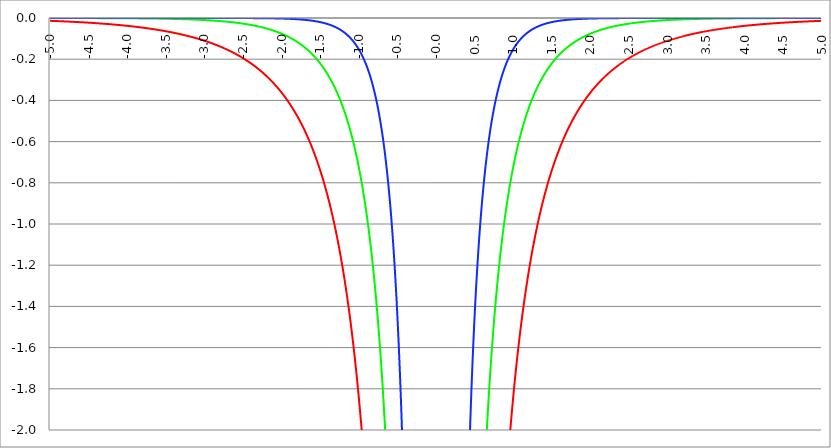
| Category | Series 1 | Series 0 | Series 2 |
|---|---|---|---|
| -5.0 | -0.014 | 0 | 0 |
| -4.995 | -0.014 | 0 | 0 |
| -4.99 | -0.014 | 0 | 0 |
| -4.985 | -0.014 | 0 | 0 |
| -4.98 | -0.014 | 0 | 0 |
| -4.975 | -0.014 | 0 | 0 |
| -4.97 | -0.014 | 0 | 0 |
| -4.965000000000001 | -0.014 | 0 | 0 |
| -4.960000000000001 | -0.014 | 0 | 0 |
| -4.955000000000001 | -0.014 | 0 | 0 |
| -4.950000000000001 | -0.014 | 0 | 0 |
| -4.945000000000001 | -0.014 | 0 | 0 |
| -4.940000000000001 | -0.015 | 0 | 0 |
| -4.935000000000001 | -0.015 | 0 | 0 |
| -4.930000000000001 | -0.015 | 0 | 0 |
| -4.925000000000002 | -0.015 | 0 | 0 |
| -4.920000000000002 | -0.015 | 0 | 0 |
| -4.915000000000002 | -0.015 | 0 | 0 |
| -4.910000000000002 | -0.015 | 0 | 0 |
| -4.905000000000002 | -0.015 | 0 | 0 |
| -4.900000000000002 | -0.015 | 0 | 0 |
| -4.895000000000002 | -0.015 | 0 | 0 |
| -4.890000000000002 | -0.015 | 0 | 0 |
| -4.885000000000002 | -0.015 | 0 | 0 |
| -4.880000000000002 | -0.015 | 0 | 0 |
| -4.875000000000003 | -0.016 | 0 | 0 |
| -4.870000000000003 | -0.016 | 0 | 0 |
| -4.865000000000003 | -0.016 | 0 | 0 |
| -4.860000000000003 | -0.016 | 0 | 0 |
| -4.855000000000003 | -0.016 | 0 | 0 |
| -4.850000000000003 | -0.016 | 0 | 0 |
| -4.845000000000003 | -0.016 | 0 | 0 |
| -4.840000000000003 | -0.016 | 0 | 0 |
| -4.835000000000003 | -0.016 | 0 | 0 |
| -4.830000000000004 | -0.016 | 0 | 0 |
| -4.825000000000004 | -0.016 | 0 | 0 |
| -4.820000000000004 | -0.016 | 0 | 0 |
| -4.815000000000004 | -0.016 | 0 | 0 |
| -4.810000000000004 | -0.017 | 0 | 0 |
| -4.805000000000004 | -0.017 | 0 | 0 |
| -4.800000000000004 | -0.017 | 0 | 0 |
| -4.795000000000004 | -0.017 | 0 | 0 |
| -4.790000000000004 | -0.017 | 0 | 0 |
| -4.785000000000004 | -0.017 | 0 | 0 |
| -4.780000000000004 | -0.017 | 0 | 0 |
| -4.775000000000004 | -0.017 | 0 | 0 |
| -4.770000000000004 | -0.017 | 0 | 0 |
| -4.765000000000005 | -0.017 | 0 | 0 |
| -4.760000000000005 | -0.017 | 0 | 0 |
| -4.755000000000005 | -0.018 | 0 | 0 |
| -4.750000000000005 | -0.018 | 0 | 0 |
| -4.745000000000005 | -0.018 | 0 | 0 |
| -4.740000000000005 | -0.018 | 0 | 0 |
| -4.735000000000005 | -0.018 | 0 | 0 |
| -4.730000000000005 | -0.018 | 0 | 0 |
| -4.725000000000006 | -0.018 | 0 | 0 |
| -4.720000000000006 | -0.018 | 0 | 0 |
| -4.715000000000006 | -0.018 | 0 | 0 |
| -4.710000000000006 | -0.018 | 0 | 0 |
| -4.705000000000006 | -0.018 | 0 | 0 |
| -4.700000000000006 | -0.019 | 0 | 0 |
| -4.695000000000006 | -0.019 | 0 | 0 |
| -4.690000000000006 | -0.019 | 0 | 0 |
| -4.685000000000007 | -0.019 | 0 | 0 |
| -4.680000000000007 | -0.019 | 0 | 0 |
| -4.675000000000007 | -0.019 | 0 | 0 |
| -4.670000000000007 | -0.019 | 0 | 0 |
| -4.665000000000007 | -0.019 | 0 | 0 |
| -4.660000000000007 | -0.019 | 0 | 0 |
| -4.655000000000007 | -0.019 | 0 | 0 |
| -4.650000000000007 | -0.019 | 0 | 0 |
| -4.645000000000007 | -0.02 | 0 | 0 |
| -4.640000000000008 | -0.02 | 0 | 0 |
| -4.635000000000008 | -0.02 | 0 | 0 |
| -4.630000000000008 | -0.02 | 0 | 0 |
| -4.625000000000008 | -0.02 | 0 | 0 |
| -4.620000000000008 | -0.02 | 0 | 0 |
| -4.615000000000008 | -0.02 | 0 | 0 |
| -4.610000000000008 | -0.02 | 0 | 0 |
| -4.605000000000008 | -0.02 | 0 | 0 |
| -4.600000000000008 | -0.021 | 0 | 0 |
| -4.595000000000009 | -0.021 | 0 | 0 |
| -4.590000000000009 | -0.021 | 0 | 0 |
| -4.585000000000009 | -0.021 | 0 | 0 |
| -4.580000000000009 | -0.021 | 0 | 0 |
| -4.57500000000001 | -0.021 | 0 | 0 |
| -4.57000000000001 | -0.021 | 0 | 0 |
| -4.565000000000009 | -0.021 | 0 | 0 |
| -4.560000000000009 | -0.021 | 0 | 0 |
| -4.555000000000009 | -0.021 | 0 | 0 |
| -4.55000000000001 | -0.022 | 0 | 0 |
| -4.54500000000001 | -0.022 | 0 | 0 |
| -4.54000000000001 | -0.022 | 0 | 0 |
| -4.53500000000001 | -0.022 | 0 | 0 |
| -4.53000000000001 | -0.022 | 0 | 0 |
| -4.52500000000001 | -0.022 | 0 | 0 |
| -4.52000000000001 | -0.022 | 0 | 0 |
| -4.51500000000001 | -0.022 | 0 | 0 |
| -4.51000000000001 | -0.022 | 0 | 0 |
| -4.505000000000011 | -0.023 | 0 | 0 |
| -4.500000000000011 | -0.023 | 0 | 0 |
| -4.495000000000011 | -0.023 | 0 | 0 |
| -4.490000000000011 | -0.023 | -0.001 | 0 |
| -4.485000000000011 | -0.023 | -0.001 | 0 |
| -4.480000000000011 | -0.023 | -0.001 | 0 |
| -4.475000000000011 | -0.023 | -0.001 | 0 |
| -4.470000000000011 | -0.023 | -0.001 | 0 |
| -4.465000000000011 | -0.024 | -0.001 | 0 |
| -4.460000000000011 | -0.024 | -0.001 | 0 |
| -4.455000000000012 | -0.024 | -0.001 | 0 |
| -4.450000000000012 | -0.024 | -0.001 | 0 |
| -4.445000000000012 | -0.024 | -0.001 | 0 |
| -4.440000000000012 | -0.024 | -0.001 | 0 |
| -4.435000000000012 | -0.024 | -0.001 | 0 |
| -4.430000000000012 | -0.024 | -0.001 | 0 |
| -4.425000000000012 | -0.025 | -0.001 | 0 |
| -4.420000000000012 | -0.025 | -0.001 | 0 |
| -4.415000000000012 | -0.025 | -0.001 | 0 |
| -4.410000000000013 | -0.025 | -0.001 | 0 |
| -4.405000000000013 | -0.025 | -0.001 | 0 |
| -4.400000000000013 | -0.025 | -0.001 | 0 |
| -4.395000000000013 | -0.025 | -0.001 | 0 |
| -4.390000000000013 | -0.025 | -0.001 | 0 |
| -4.385000000000013 | -0.026 | -0.001 | 0 |
| -4.380000000000013 | -0.026 | -0.001 | 0 |
| -4.375000000000013 | -0.026 | -0.001 | 0 |
| -4.370000000000013 | -0.026 | -0.001 | 0 |
| -4.365000000000013 | -0.026 | -0.001 | 0 |
| -4.360000000000014 | -0.026 | -0.001 | 0 |
| -4.355000000000014 | -0.026 | -0.001 | 0 |
| -4.350000000000014 | -0.026 | -0.001 | 0 |
| -4.345000000000014 | -0.027 | -0.001 | 0 |
| -4.340000000000014 | -0.027 | -0.001 | 0 |
| -4.335000000000014 | -0.027 | -0.001 | 0 |
| -4.330000000000014 | -0.027 | -0.001 | 0 |
| -4.325000000000014 | -0.027 | -0.001 | 0 |
| -4.320000000000014 | -0.027 | -0.001 | 0 |
| -4.315000000000015 | -0.027 | -0.001 | 0 |
| -4.310000000000015 | -0.028 | -0.001 | 0 |
| -4.305000000000015 | -0.028 | -0.001 | 0 |
| -4.300000000000015 | -0.028 | -0.001 | 0 |
| -4.295000000000015 | -0.028 | -0.001 | 0 |
| -4.290000000000015 | -0.028 | -0.001 | 0 |
| -4.285000000000015 | -0.028 | -0.001 | 0 |
| -4.280000000000015 | -0.028 | -0.001 | 0 |
| -4.275000000000015 | -0.029 | -0.001 | 0 |
| -4.270000000000015 | -0.029 | -0.001 | 0 |
| -4.265000000000016 | -0.029 | -0.001 | 0 |
| -4.260000000000016 | -0.029 | -0.001 | 0 |
| -4.255000000000016 | -0.029 | -0.001 | 0 |
| -4.250000000000016 | -0.029 | -0.001 | 0 |
| -4.245000000000016 | -0.03 | -0.001 | 0 |
| -4.240000000000016 | -0.03 | -0.001 | 0 |
| -4.235000000000016 | -0.03 | -0.001 | 0 |
| -4.230000000000016 | -0.03 | -0.001 | 0 |
| -4.225000000000017 | -0.03 | -0.001 | 0 |
| -4.220000000000017 | -0.03 | -0.001 | 0 |
| -4.215000000000017 | -0.03 | -0.001 | 0 |
| -4.210000000000017 | -0.031 | -0.001 | 0 |
| -4.205000000000017 | -0.031 | -0.001 | 0 |
| -4.200000000000017 | -0.031 | -0.001 | 0 |
| -4.195000000000017 | -0.031 | -0.001 | 0 |
| -4.190000000000017 | -0.031 | -0.001 | 0 |
| -4.185000000000017 | -0.031 | -0.001 | 0 |
| -4.180000000000017 | -0.032 | -0.001 | 0 |
| -4.175000000000018 | -0.032 | -0.001 | 0 |
| -4.170000000000018 | -0.032 | -0.001 | 0 |
| -4.165000000000018 | -0.032 | -0.001 | 0 |
| -4.160000000000018 | -0.032 | -0.001 | 0 |
| -4.155000000000018 | -0.032 | -0.001 | 0 |
| -4.150000000000018 | -0.033 | -0.001 | 0 |
| -4.145000000000018 | -0.033 | -0.001 | 0 |
| -4.140000000000018 | -0.033 | -0.001 | 0 |
| -4.135000000000018 | -0.033 | -0.001 | 0 |
| -4.130000000000019 | -0.033 | -0.001 | 0 |
| -4.125000000000019 | -0.033 | -0.001 | 0 |
| -4.120000000000019 | -0.034 | -0.001 | 0 |
| -4.115000000000019 | -0.034 | -0.001 | 0 |
| -4.110000000000019 | -0.034 | -0.001 | 0 |
| -4.105000000000019 | -0.034 | -0.001 | 0 |
| -4.100000000000019 | -0.034 | -0.001 | 0 |
| -4.095000000000019 | -0.034 | -0.001 | 0 |
| -4.090000000000019 | -0.035 | -0.001 | 0 |
| -4.085000000000019 | -0.035 | -0.001 | 0 |
| -4.08000000000002 | -0.035 | -0.001 | 0 |
| -4.07500000000002 | -0.035 | -0.001 | 0 |
| -4.07000000000002 | -0.035 | -0.001 | 0 |
| -4.06500000000002 | -0.036 | -0.001 | 0 |
| -4.06000000000002 | -0.036 | -0.001 | 0 |
| -4.05500000000002 | -0.036 | -0.001 | 0 |
| -4.05000000000002 | -0.036 | -0.001 | 0 |
| -4.04500000000002 | -0.036 | -0.001 | 0 |
| -4.04000000000002 | -0.036 | -0.001 | 0 |
| -4.03500000000002 | -0.037 | -0.001 | 0 |
| -4.03000000000002 | -0.037 | -0.001 | 0 |
| -4.025000000000021 | -0.037 | -0.001 | 0 |
| -4.020000000000021 | -0.037 | -0.001 | 0 |
| -4.015000000000021 | -0.037 | -0.001 | 0 |
| -4.010000000000021 | -0.038 | -0.001 | 0 |
| -4.005000000000021 | -0.038 | -0.001 | 0 |
| -4.000000000000021 | -0.038 | -0.001 | 0 |
| -3.995000000000021 | -0.038 | -0.001 | 0 |
| -3.990000000000021 | -0.038 | -0.001 | 0 |
| -3.985000000000022 | -0.039 | -0.001 | 0 |
| -3.980000000000022 | -0.039 | -0.001 | 0 |
| -3.975000000000022 | -0.039 | -0.001 | 0 |
| -3.970000000000022 | -0.039 | -0.001 | 0 |
| -3.965000000000022 | -0.039 | -0.001 | 0 |
| -3.960000000000022 | -0.04 | -0.001 | 0 |
| -3.955000000000022 | -0.04 | -0.001 | 0 |
| -3.950000000000022 | -0.04 | -0.001 | 0 |
| -3.945000000000022 | -0.04 | -0.001 | 0 |
| -3.940000000000023 | -0.04 | -0.002 | 0 |
| -3.935000000000023 | -0.041 | -0.002 | 0 |
| -3.930000000000023 | -0.041 | -0.002 | 0 |
| -3.925000000000023 | -0.041 | -0.002 | 0 |
| -3.920000000000023 | -0.041 | -0.002 | 0 |
| -3.915000000000023 | -0.042 | -0.002 | 0 |
| -3.910000000000023 | -0.042 | -0.002 | 0 |
| -3.905000000000023 | -0.042 | -0.002 | 0 |
| -3.900000000000023 | -0.042 | -0.002 | 0 |
| -3.895000000000023 | -0.042 | -0.002 | 0 |
| -3.890000000000024 | -0.043 | -0.002 | 0 |
| -3.885000000000024 | -0.043 | -0.002 | 0 |
| -3.880000000000024 | -0.043 | -0.002 | 0 |
| -3.875000000000024 | -0.043 | -0.002 | 0 |
| -3.870000000000024 | -0.044 | -0.002 | 0 |
| -3.865000000000024 | -0.044 | -0.002 | 0 |
| -3.860000000000024 | -0.044 | -0.002 | 0 |
| -3.855000000000024 | -0.044 | -0.002 | 0 |
| -3.850000000000024 | -0.044 | -0.002 | 0 |
| -3.845000000000025 | -0.045 | -0.002 | 0 |
| -3.840000000000025 | -0.045 | -0.002 | 0 |
| -3.835000000000025 | -0.045 | -0.002 | 0 |
| -3.830000000000025 | -0.045 | -0.002 | 0 |
| -3.825000000000025 | -0.046 | -0.002 | 0 |
| -3.820000000000025 | -0.046 | -0.002 | 0 |
| -3.815000000000025 | -0.046 | -0.002 | 0 |
| -3.810000000000025 | -0.046 | -0.002 | 0 |
| -3.805000000000025 | -0.047 | -0.002 | 0 |
| -3.800000000000026 | -0.047 | -0.002 | 0 |
| -3.795000000000026 | -0.047 | -0.002 | 0 |
| -3.790000000000026 | -0.047 | -0.002 | 0 |
| -3.785000000000026 | -0.048 | -0.002 | 0 |
| -3.780000000000026 | -0.048 | -0.002 | 0 |
| -3.775000000000026 | -0.048 | -0.002 | 0 |
| -3.770000000000026 | -0.048 | -0.002 | 0 |
| -3.765000000000026 | -0.049 | -0.002 | 0 |
| -3.760000000000026 | -0.049 | -0.002 | 0 |
| -3.755000000000026 | -0.049 | -0.002 | 0 |
| -3.750000000000027 | -0.049 | -0.002 | 0 |
| -3.745000000000027 | -0.05 | -0.002 | 0 |
| -3.740000000000027 | -0.05 | -0.002 | 0 |
| -3.735000000000027 | -0.05 | -0.002 | 0 |
| -3.730000000000027 | -0.05 | -0.002 | 0 |
| -3.725000000000027 | -0.051 | -0.002 | 0 |
| -3.720000000000027 | -0.051 | -0.002 | 0 |
| -3.715000000000027 | -0.051 | -0.002 | 0 |
| -3.710000000000027 | -0.051 | -0.002 | 0 |
| -3.705000000000028 | -0.052 | -0.002 | 0 |
| -3.700000000000028 | -0.052 | -0.002 | 0 |
| -3.695000000000028 | -0.052 | -0.002 | 0 |
| -3.690000000000028 | -0.053 | -0.002 | 0 |
| -3.685000000000028 | -0.053 | -0.003 | 0 |
| -3.680000000000028 | -0.053 | -0.003 | 0 |
| -3.675000000000028 | -0.053 | -0.003 | 0 |
| -3.670000000000028 | -0.054 | -0.003 | 0 |
| -3.665000000000028 | -0.054 | -0.003 | 0 |
| -3.660000000000028 | -0.054 | -0.003 | 0 |
| -3.655000000000029 | -0.055 | -0.003 | 0 |
| -3.650000000000029 | -0.055 | -0.003 | 0 |
| -3.645000000000029 | -0.055 | -0.003 | 0 |
| -3.640000000000029 | -0.055 | -0.003 | 0 |
| -3.635000000000029 | -0.056 | -0.003 | 0 |
| -3.630000000000029 | -0.056 | -0.003 | 0 |
| -3.625000000000029 | -0.056 | -0.003 | 0 |
| -3.620000000000029 | -0.057 | -0.003 | 0 |
| -3.615000000000029 | -0.057 | -0.003 | 0 |
| -3.61000000000003 | -0.057 | -0.003 | 0 |
| -3.60500000000003 | -0.057 | -0.003 | 0 |
| -3.60000000000003 | -0.058 | -0.003 | 0 |
| -3.59500000000003 | -0.058 | -0.003 | 0 |
| -3.59000000000003 | -0.058 | -0.003 | 0 |
| -3.58500000000003 | -0.059 | -0.003 | 0 |
| -3.58000000000003 | -0.059 | -0.003 | 0 |
| -3.57500000000003 | -0.059 | -0.003 | 0 |
| -3.57000000000003 | -0.06 | -0.003 | 0 |
| -3.565000000000031 | -0.06 | -0.003 | 0 |
| -3.560000000000031 | -0.06 | -0.003 | 0 |
| -3.555000000000031 | -0.061 | -0.003 | 0 |
| -3.550000000000031 | -0.061 | -0.003 | 0 |
| -3.545000000000031 | -0.061 | -0.003 | 0 |
| -3.540000000000031 | -0.062 | -0.003 | 0 |
| -3.535000000000031 | -0.062 | -0.003 | 0 |
| -3.530000000000031 | -0.062 | -0.003 | 0 |
| -3.525000000000031 | -0.063 | -0.003 | 0 |
| -3.520000000000032 | -0.063 | -0.004 | 0 |
| -3.515000000000032 | -0.063 | -0.004 | 0 |
| -3.510000000000032 | -0.064 | -0.004 | 0 |
| -3.505000000000032 | -0.064 | -0.004 | 0 |
| -3.500000000000032 | -0.064 | -0.004 | 0 |
| -3.495000000000032 | -0.065 | -0.004 | 0 |
| -3.490000000000032 | -0.065 | -0.004 | 0 |
| -3.485000000000032 | -0.065 | -0.004 | 0 |
| -3.480000000000032 | -0.066 | -0.004 | 0 |
| -3.475000000000032 | -0.066 | -0.004 | 0 |
| -3.470000000000033 | -0.066 | -0.004 | 0 |
| -3.465000000000033 | -0.067 | -0.004 | 0 |
| -3.460000000000033 | -0.067 | -0.004 | 0 |
| -3.455000000000033 | -0.067 | -0.004 | 0 |
| -3.450000000000033 | -0.068 | -0.004 | 0 |
| -3.445000000000033 | -0.068 | -0.004 | 0 |
| -3.440000000000033 | -0.068 | -0.004 | 0 |
| -3.435000000000033 | -0.069 | -0.004 | 0 |
| -3.430000000000033 | -0.069 | -0.004 | 0 |
| -3.425000000000034 | -0.07 | -0.004 | 0 |
| -3.420000000000034 | -0.07 | -0.004 | 0 |
| -3.415000000000034 | -0.07 | -0.004 | 0 |
| -3.410000000000034 | -0.071 | -0.004 | 0 |
| -3.405000000000034 | -0.071 | -0.004 | 0 |
| -3.400000000000034 | -0.071 | -0.004 | 0 |
| -3.395000000000034 | -0.072 | -0.005 | 0 |
| -3.390000000000034 | -0.072 | -0.005 | 0 |
| -3.385000000000034 | -0.073 | -0.005 | 0 |
| -3.380000000000034 | -0.073 | -0.005 | 0 |
| -3.375000000000035 | -0.073 | -0.005 | 0 |
| -3.370000000000035 | -0.074 | -0.005 | 0 |
| -3.365000000000035 | -0.074 | -0.005 | 0 |
| -3.360000000000035 | -0.075 | -0.005 | 0 |
| -3.355000000000035 | -0.075 | -0.005 | 0 |
| -3.350000000000035 | -0.075 | -0.005 | 0 |
| -3.345000000000035 | -0.076 | -0.005 | 0 |
| -3.340000000000035 | -0.076 | -0.005 | 0 |
| -3.335000000000035 | -0.077 | -0.005 | 0 |
| -3.330000000000036 | -0.077 | -0.005 | 0 |
| -3.325000000000036 | -0.077 | -0.005 | 0 |
| -3.320000000000036 | -0.078 | -0.005 | 0 |
| -3.315000000000036 | -0.078 | -0.005 | 0 |
| -3.310000000000036 | -0.079 | -0.005 | 0 |
| -3.305000000000036 | -0.079 | -0.005 | 0 |
| -3.300000000000036 | -0.08 | -0.005 | 0 |
| -3.295000000000036 | -0.08 | -0.006 | 0 |
| -3.290000000000036 | -0.08 | -0.006 | 0 |
| -3.285000000000036 | -0.081 | -0.006 | 0 |
| -3.280000000000036 | -0.081 | -0.006 | 0 |
| -3.275000000000037 | -0.082 | -0.006 | 0 |
| -3.270000000000037 | -0.082 | -0.006 | 0 |
| -3.265000000000037 | -0.083 | -0.006 | 0 |
| -3.260000000000037 | -0.083 | -0.006 | 0 |
| -3.255000000000037 | -0.083 | -0.006 | 0 |
| -3.250000000000037 | -0.084 | -0.006 | 0 |
| -3.245000000000037 | -0.084 | -0.006 | 0 |
| -3.240000000000037 | -0.085 | -0.006 | 0 |
| -3.235000000000038 | -0.085 | -0.006 | 0 |
| -3.230000000000038 | -0.086 | -0.006 | 0 |
| -3.225000000000038 | -0.086 | -0.006 | 0 |
| -3.220000000000038 | -0.087 | -0.006 | 0 |
| -3.215000000000038 | -0.087 | -0.006 | 0 |
| -3.210000000000038 | -0.088 | -0.007 | 0 |
| -3.205000000000038 | -0.088 | -0.007 | 0 |
| -3.200000000000038 | -0.089 | -0.007 | 0 |
| -3.195000000000038 | -0.089 | -0.007 | 0 |
| -3.190000000000039 | -0.09 | -0.007 | 0 |
| -3.185000000000039 | -0.09 | -0.007 | 0 |
| -3.180000000000039 | -0.091 | -0.007 | 0 |
| -3.175000000000039 | -0.091 | -0.007 | 0 |
| -3.170000000000039 | -0.092 | -0.007 | 0 |
| -3.16500000000004 | -0.092 | -0.007 | 0 |
| -3.16000000000004 | -0.093 | -0.007 | 0 |
| -3.155000000000039 | -0.093 | -0.007 | 0 |
| -3.150000000000039 | -0.094 | -0.007 | 0 |
| -3.14500000000004 | -0.094 | -0.007 | 0 |
| -3.14000000000004 | -0.095 | -0.008 | 0 |
| -3.13500000000004 | -0.095 | -0.008 | 0 |
| -3.13000000000004 | -0.096 | -0.008 | 0 |
| -3.12500000000004 | -0.096 | -0.008 | 0 |
| -3.12000000000004 | -0.097 | -0.008 | 0 |
| -3.11500000000004 | -0.097 | -0.008 | 0 |
| -3.11000000000004 | -0.098 | -0.008 | 0 |
| -3.10500000000004 | -0.098 | -0.008 | 0 |
| -3.10000000000004 | -0.099 | -0.008 | 0 |
| -3.095000000000041 | -0.099 | -0.008 | 0 |
| -3.090000000000041 | -0.1 | -0.008 | 0 |
| -3.085000000000041 | -0.1 | -0.008 | 0 |
| -3.080000000000041 | -0.101 | -0.008 | 0 |
| -3.075000000000041 | -0.102 | -0.009 | 0 |
| -3.070000000000041 | -0.102 | -0.009 | 0 |
| -3.065000000000041 | -0.103 | -0.009 | 0 |
| -3.060000000000041 | -0.103 | -0.009 | 0 |
| -3.055000000000041 | -0.104 | -0.009 | 0 |
| -3.050000000000042 | -0.104 | -0.009 | 0 |
| -3.045000000000042 | -0.105 | -0.009 | 0 |
| -3.040000000000042 | -0.106 | -0.009 | 0 |
| -3.035000000000042 | -0.106 | -0.009 | 0 |
| -3.030000000000042 | -0.107 | -0.009 | 0 |
| -3.025000000000042 | -0.107 | -0.009 | 0 |
| -3.020000000000042 | -0.108 | -0.01 | 0 |
| -3.015000000000042 | -0.108 | -0.01 | 0 |
| -3.010000000000042 | -0.109 | -0.01 | 0 |
| -3.005000000000043 | -0.11 | -0.01 | 0 |
| -3.000000000000043 | -0.11 | -0.01 | 0 |
| -2.995000000000043 | -0.111 | -0.01 | 0 |
| -2.990000000000043 | -0.112 | -0.01 | 0 |
| -2.985000000000043 | -0.112 | -0.01 | 0 |
| -2.980000000000043 | -0.113 | -0.01 | 0 |
| -2.975000000000043 | -0.113 | -0.01 | 0 |
| -2.970000000000043 | -0.114 | -0.011 | 0 |
| -2.965000000000043 | -0.115 | -0.011 | 0 |
| -2.960000000000043 | -0.115 | -0.011 | 0 |
| -2.955000000000044 | -0.116 | -0.011 | 0 |
| -2.950000000000044 | -0.117 | -0.011 | 0 |
| -2.945000000000044 | -0.117 | -0.011 | 0 |
| -2.940000000000044 | -0.118 | -0.011 | 0 |
| -2.935000000000044 | -0.119 | -0.011 | 0 |
| -2.930000000000044 | -0.119 | -0.011 | 0 |
| -2.925000000000044 | -0.12 | -0.012 | 0 |
| -2.920000000000044 | -0.121 | -0.012 | 0 |
| -2.915000000000044 | -0.121 | -0.012 | 0 |
| -2.910000000000045 | -0.122 | -0.012 | 0 |
| -2.905000000000045 | -0.123 | -0.012 | 0 |
| -2.900000000000045 | -0.123 | -0.012 | 0 |
| -2.895000000000045 | -0.124 | -0.012 | 0 |
| -2.890000000000045 | -0.125 | -0.012 | 0 |
| -2.885000000000045 | -0.125 | -0.013 | 0 |
| -2.880000000000045 | -0.126 | -0.013 | 0 |
| -2.875000000000045 | -0.127 | -0.013 | 0 |
| -2.870000000000045 | -0.127 | -0.013 | 0 |
| -2.865000000000045 | -0.128 | -0.013 | 0 |
| -2.860000000000046 | -0.129 | -0.013 | 0 |
| -2.855000000000046 | -0.13 | -0.013 | 0 |
| -2.850000000000046 | -0.13 | -0.013 | 0 |
| -2.845000000000046 | -0.131 | -0.014 | 0 |
| -2.840000000000046 | -0.132 | -0.014 | 0 |
| -2.835000000000046 | -0.133 | -0.014 | 0 |
| -2.830000000000046 | -0.133 | -0.014 | 0 |
| -2.825000000000046 | -0.134 | -0.014 | 0 |
| -2.820000000000046 | -0.135 | -0.014 | 0 |
| -2.815000000000047 | -0.136 | -0.014 | 0 |
| -2.810000000000047 | -0.136 | -0.015 | 0 |
| -2.805000000000047 | -0.137 | -0.015 | 0 |
| -2.800000000000047 | -0.138 | -0.015 | 0 |
| -2.795000000000047 | -0.139 | -0.015 | 0 |
| -2.790000000000047 | -0.139 | -0.015 | 0 |
| -2.785000000000047 | -0.14 | -0.015 | 0 |
| -2.780000000000047 | -0.141 | -0.016 | 0 |
| -2.775000000000047 | -0.142 | -0.016 | 0 |
| -2.770000000000047 | -0.143 | -0.016 | 0 |
| -2.765000000000048 | -0.143 | -0.016 | 0 |
| -2.760000000000048 | -0.144 | -0.016 | 0 |
| -2.755000000000048 | -0.145 | -0.016 | 0 |
| -2.750000000000048 | -0.146 | -0.016 | 0 |
| -2.745000000000048 | -0.147 | -0.017 | 0 |
| -2.740000000000048 | -0.148 | -0.017 | 0 |
| -2.735000000000048 | -0.148 | -0.017 | 0 |
| -2.730000000000048 | -0.149 | -0.017 | 0 |
| -2.725000000000048 | -0.15 | -0.017 | 0 |
| -2.720000000000049 | -0.151 | -0.018 | 0 |
| -2.715000000000049 | -0.152 | -0.018 | 0 |
| -2.710000000000049 | -0.153 | -0.018 | 0 |
| -2.705000000000049 | -0.154 | -0.018 | 0 |
| -2.700000000000049 | -0.154 | -0.018 | 0 |
| -2.695000000000049 | -0.155 | -0.018 | 0 |
| -2.690000000000049 | -0.156 | -0.019 | 0 |
| -2.685000000000049 | -0.157 | -0.019 | 0 |
| -2.680000000000049 | -0.158 | -0.019 | 0 |
| -2.675000000000049 | -0.159 | -0.019 | 0 |
| -2.67000000000005 | -0.16 | -0.019 | 0 |
| -2.66500000000005 | -0.161 | -0.02 | 0 |
| -2.66000000000005 | -0.162 | -0.02 | 0 |
| -2.65500000000005 | -0.163 | -0.02 | 0 |
| -2.65000000000005 | -0.164 | -0.02 | 0 |
| -2.64500000000005 | -0.165 | -0.02 | 0 |
| -2.64000000000005 | -0.166 | -0.021 | 0 |
| -2.63500000000005 | -0.166 | -0.021 | 0 |
| -2.63000000000005 | -0.167 | -0.021 | 0 |
| -2.625000000000051 | -0.168 | -0.021 | 0 |
| -2.620000000000051 | -0.169 | -0.021 | 0 |
| -2.615000000000051 | -0.17 | -0.022 | 0 |
| -2.610000000000051 | -0.171 | -0.022 | 0 |
| -2.605000000000051 | -0.172 | -0.022 | 0 |
| -2.600000000000051 | -0.173 | -0.022 | 0 |
| -2.595000000000051 | -0.174 | -0.023 | 0 |
| -2.590000000000051 | -0.175 | -0.023 | 0 |
| -2.585000000000051 | -0.176 | -0.023 | 0 |
| -2.580000000000052 | -0.177 | -0.023 | 0 |
| -2.575000000000052 | -0.178 | -0.023 | 0 |
| -2.570000000000052 | -0.179 | -0.024 | 0 |
| -2.565000000000052 | -0.181 | -0.024 | 0 |
| -2.560000000000052 | -0.182 | -0.024 | 0 |
| -2.555000000000052 | -0.183 | -0.024 | 0 |
| -2.550000000000052 | -0.184 | -0.025 | 0 |
| -2.545000000000052 | -0.185 | -0.025 | 0 |
| -2.540000000000052 | -0.186 | -0.025 | 0 |
| -2.535000000000053 | -0.187 | -0.025 | 0 |
| -2.530000000000053 | -0.188 | -0.026 | 0 |
| -2.525000000000053 | -0.189 | -0.026 | 0 |
| -2.520000000000053 | -0.19 | -0.026 | 0 |
| -2.515000000000053 | -0.191 | -0.027 | 0 |
| -2.510000000000053 | -0.193 | -0.027 | 0 |
| -2.505000000000053 | -0.194 | -0.027 | 0 |
| -2.500000000000053 | -0.195 | -0.027 | 0 |
| -2.495000000000053 | -0.196 | -0.028 | 0 |
| -2.490000000000053 | -0.197 | -0.028 | 0 |
| -2.485000000000054 | -0.198 | -0.028 | 0 |
| -2.480000000000054 | -0.2 | -0.028 | 0 |
| -2.475000000000054 | -0.201 | -0.029 | 0 |
| -2.470000000000054 | -0.202 | -0.029 | 0 |
| -2.465000000000054 | -0.203 | -0.029 | 0 |
| -2.460000000000054 | -0.204 | -0.03 | 0 |
| -2.455000000000054 | -0.206 | -0.03 | 0 |
| -2.450000000000054 | -0.207 | -0.03 | 0 |
| -2.445000000000054 | -0.208 | -0.031 | 0 |
| -2.440000000000055 | -0.209 | -0.031 | 0 |
| -2.435000000000055 | -0.21 | -0.031 | 0 |
| -2.430000000000055 | -0.212 | -0.031 | 0 |
| -2.425000000000055 | -0.213 | -0.032 | 0 |
| -2.420000000000055 | -0.214 | -0.032 | -0.001 |
| -2.415000000000055 | -0.216 | -0.032 | -0.001 |
| -2.410000000000055 | -0.217 | -0.033 | -0.001 |
| -2.405000000000055 | -0.218 | -0.033 | -0.001 |
| -2.400000000000055 | -0.219 | -0.033 | -0.001 |
| -2.395000000000055 | -0.221 | -0.034 | -0.001 |
| -2.390000000000056 | -0.222 | -0.034 | -0.001 |
| -2.385000000000056 | -0.223 | -0.035 | -0.001 |
| -2.380000000000056 | -0.225 | -0.035 | -0.001 |
| -2.375000000000056 | -0.226 | -0.035 | -0.001 |
| -2.370000000000056 | -0.228 | -0.036 | -0.001 |
| -2.365000000000056 | -0.229 | -0.036 | -0.001 |
| -2.360000000000056 | -0.23 | -0.036 | -0.001 |
| -2.355000000000056 | -0.232 | -0.037 | -0.001 |
| -2.350000000000056 | -0.233 | -0.037 | -0.001 |
| -2.345000000000057 | -0.234 | -0.037 | -0.001 |
| -2.340000000000057 | -0.236 | -0.038 | -0.001 |
| -2.335000000000057 | -0.237 | -0.038 | -0.001 |
| -2.330000000000057 | -0.239 | -0.039 | -0.001 |
| -2.325000000000057 | -0.24 | -0.039 | -0.001 |
| -2.320000000000057 | -0.242 | -0.039 | -0.001 |
| -2.315000000000057 | -0.243 | -0.04 | -0.001 |
| -2.310000000000057 | -0.245 | -0.04 | -0.001 |
| -2.305000000000057 | -0.246 | -0.041 | -0.001 |
| -2.300000000000058 | -0.248 | -0.041 | -0.001 |
| -2.295000000000058 | -0.249 | -0.041 | -0.001 |
| -2.290000000000058 | -0.251 | -0.042 | -0.001 |
| -2.285000000000058 | -0.252 | -0.042 | -0.001 |
| -2.280000000000058 | -0.254 | -0.043 | -0.001 |
| -2.275000000000058 | -0.255 | -0.043 | -0.001 |
| -2.270000000000058 | -0.257 | -0.044 | -0.001 |
| -2.265000000000058 | -0.259 | -0.044 | -0.001 |
| -2.260000000000058 | -0.26 | -0.045 | -0.001 |
| -2.255000000000058 | -0.262 | -0.045 | -0.001 |
| -2.250000000000059 | -0.263 | -0.045 | -0.001 |
| -2.245000000000059 | -0.265 | -0.046 | -0.001 |
| -2.240000000000059 | -0.267 | -0.046 | -0.001 |
| -2.235000000000059 | -0.268 | -0.047 | -0.001 |
| -2.23000000000006 | -0.27 | -0.047 | -0.001 |
| -2.22500000000006 | -0.272 | -0.048 | -0.001 |
| -2.22000000000006 | -0.273 | -0.048 | -0.001 |
| -2.215000000000059 | -0.275 | -0.049 | -0.001 |
| -2.210000000000059 | -0.277 | -0.049 | -0.001 |
| -2.20500000000006 | -0.279 | -0.05 | -0.001 |
| -2.20000000000006 | -0.28 | -0.05 | -0.001 |
| -2.19500000000006 | -0.282 | -0.051 | -0.001 |
| -2.19000000000006 | -0.284 | -0.051 | -0.001 |
| -2.18500000000006 | -0.286 | -0.052 | -0.001 |
| -2.18000000000006 | -0.287 | -0.052 | -0.001 |
| -2.17500000000006 | -0.289 | -0.053 | -0.001 |
| -2.17000000000006 | -0.291 | -0.054 | -0.001 |
| -2.16500000000006 | -0.293 | -0.054 | -0.001 |
| -2.160000000000061 | -0.295 | -0.055 | -0.001 |
| -2.155000000000061 | -0.297 | -0.055 | -0.001 |
| -2.150000000000061 | -0.298 | -0.056 | -0.001 |
| -2.145000000000061 | -0.3 | -0.056 | -0.002 |
| -2.140000000000061 | -0.302 | -0.057 | -0.002 |
| -2.135000000000061 | -0.304 | -0.058 | -0.002 |
| -2.130000000000061 | -0.306 | -0.058 | -0.002 |
| -2.125000000000061 | -0.308 | -0.059 | -0.002 |
| -2.120000000000061 | -0.31 | -0.059 | -0.002 |
| -2.115000000000061 | -0.312 | -0.06 | -0.002 |
| -2.110000000000062 | -0.314 | -0.061 | -0.002 |
| -2.105000000000062 | -0.316 | -0.061 | -0.002 |
| -2.100000000000062 | -0.318 | -0.062 | -0.002 |
| -2.095000000000062 | -0.32 | -0.062 | -0.002 |
| -2.090000000000062 | -0.322 | -0.063 | -0.002 |
| -2.085000000000062 | -0.324 | -0.064 | -0.002 |
| -2.080000000000062 | -0.326 | -0.064 | -0.002 |
| -2.075000000000062 | -0.328 | -0.065 | -0.002 |
| -2.070000000000062 | -0.331 | -0.066 | -0.002 |
| -2.065000000000063 | -0.333 | -0.066 | -0.002 |
| -2.060000000000063 | -0.335 | -0.067 | -0.002 |
| -2.055000000000063 | -0.337 | -0.068 | -0.002 |
| -2.050000000000063 | -0.339 | -0.069 | -0.002 |
| -2.045000000000063 | -0.341 | -0.069 | -0.002 |
| -2.040000000000063 | -0.344 | -0.07 | -0.002 |
| -2.035000000000063 | -0.346 | -0.071 | -0.002 |
| -2.030000000000063 | -0.348 | -0.071 | -0.002 |
| -2.025000000000063 | -0.35 | -0.072 | -0.002 |
| -2.020000000000064 | -0.353 | -0.073 | -0.002 |
| -2.015000000000064 | -0.355 | -0.074 | -0.003 |
| -2.010000000000064 | -0.357 | -0.074 | -0.003 |
| -2.005000000000064 | -0.36 | -0.075 | -0.003 |
| -2.000000000000064 | -0.362 | -0.076 | -0.003 |
| -1.995000000000064 | -0.364 | -0.077 | -0.003 |
| -1.990000000000064 | -0.367 | -0.078 | -0.003 |
| -1.985000000000064 | -0.369 | -0.078 | -0.003 |
| -1.980000000000064 | -0.372 | -0.079 | -0.003 |
| -1.975000000000064 | -0.374 | -0.08 | -0.003 |
| -1.970000000000065 | -0.377 | -0.081 | -0.003 |
| -1.965000000000065 | -0.379 | -0.082 | -0.003 |
| -1.960000000000065 | -0.382 | -0.083 | -0.003 |
| -1.955000000000065 | -0.384 | -0.083 | -0.003 |
| -1.950000000000065 | -0.387 | -0.084 | -0.003 |
| -1.945000000000065 | -0.389 | -0.085 | -0.003 |
| -1.940000000000065 | -0.392 | -0.086 | -0.003 |
| -1.935000000000065 | -0.395 | -0.087 | -0.003 |
| -1.930000000000065 | -0.397 | -0.088 | -0.004 |
| -1.925000000000066 | -0.4 | -0.089 | -0.004 |
| -1.920000000000066 | -0.403 | -0.09 | -0.004 |
| -1.915000000000066 | -0.405 | -0.091 | -0.004 |
| -1.910000000000066 | -0.408 | -0.092 | -0.004 |
| -1.905000000000066 | -0.411 | -0.093 | -0.004 |
| -1.900000000000066 | -0.414 | -0.094 | -0.004 |
| -1.895000000000066 | -0.416 | -0.095 | -0.004 |
| -1.890000000000066 | -0.419 | -0.096 | -0.004 |
| -1.885000000000066 | -0.422 | -0.097 | -0.004 |
| -1.880000000000066 | -0.425 | -0.098 | -0.004 |
| -1.875000000000067 | -0.428 | -0.099 | -0.004 |
| -1.870000000000067 | -0.431 | -0.1 | -0.005 |
| -1.865000000000067 | -0.434 | -0.101 | -0.005 |
| -1.860000000000067 | -0.437 | -0.102 | -0.005 |
| -1.855000000000067 | -0.44 | -0.103 | -0.005 |
| -1.850000000000067 | -0.443 | -0.104 | -0.005 |
| -1.845000000000067 | -0.446 | -0.105 | -0.005 |
| -1.840000000000067 | -0.449 | -0.106 | -0.005 |
| -1.835000000000067 | -0.452 | -0.107 | -0.005 |
| -1.830000000000068 | -0.455 | -0.108 | -0.005 |
| -1.825000000000068 | -0.458 | -0.11 | -0.005 |
| -1.820000000000068 | -0.461 | -0.111 | -0.006 |
| -1.815000000000068 | -0.465 | -0.112 | -0.006 |
| -1.810000000000068 | -0.468 | -0.113 | -0.006 |
| -1.805000000000068 | -0.471 | -0.114 | -0.006 |
| -1.800000000000068 | -0.475 | -0.116 | -0.006 |
| -1.795000000000068 | -0.478 | -0.117 | -0.006 |
| -1.790000000000068 | -0.481 | -0.118 | -0.006 |
| -1.785000000000068 | -0.485 | -0.119 | -0.006 |
| -1.780000000000069 | -0.488 | -0.121 | -0.006 |
| -1.775000000000069 | -0.491 | -0.122 | -0.007 |
| -1.770000000000069 | -0.495 | -0.123 | -0.007 |
| -1.765000000000069 | -0.498 | -0.124 | -0.007 |
| -1.760000000000069 | -0.502 | -0.126 | -0.007 |
| -1.75500000000007 | -0.506 | -0.127 | -0.007 |
| -1.75000000000007 | -0.509 | -0.128 | -0.007 |
| -1.745000000000069 | -0.513 | -0.13 | -0.007 |
| -1.740000000000069 | -0.516 | -0.131 | -0.008 |
| -1.73500000000007 | -0.52 | -0.133 | -0.008 |
| -1.73000000000007 | -0.524 | -0.134 | -0.008 |
| -1.72500000000007 | -0.528 | -0.135 | -0.008 |
| -1.72000000000007 | -0.531 | -0.137 | -0.008 |
| -1.71500000000007 | -0.535 | -0.138 | -0.008 |
| -1.71000000000007 | -0.539 | -0.14 | -0.009 |
| -1.70500000000007 | -0.543 | -0.141 | -0.009 |
| -1.70000000000007 | -0.547 | -0.143 | -0.009 |
| -1.69500000000007 | -0.551 | -0.144 | -0.009 |
| -1.69000000000007 | -0.555 | -0.146 | -0.009 |
| -1.685000000000071 | -0.559 | -0.148 | -0.009 |
| -1.680000000000071 | -0.563 | -0.149 | -0.01 |
| -1.675000000000071 | -0.567 | -0.151 | -0.01 |
| -1.670000000000071 | -0.571 | -0.152 | -0.01 |
| -1.665000000000071 | -0.576 | -0.154 | -0.01 |
| -1.660000000000071 | -0.58 | -0.156 | -0.01 |
| -1.655000000000071 | -0.584 | -0.157 | -0.011 |
| -1.650000000000071 | -0.588 | -0.159 | -0.011 |
| -1.645000000000071 | -0.593 | -0.161 | -0.011 |
| -1.640000000000072 | -0.597 | -0.163 | -0.011 |
| -1.635000000000072 | -0.602 | -0.164 | -0.012 |
| -1.630000000000072 | -0.606 | -0.166 | -0.012 |
| -1.625000000000072 | -0.611 | -0.168 | -0.012 |
| -1.620000000000072 | -0.615 | -0.17 | -0.012 |
| -1.615000000000072 | -0.62 | -0.172 | -0.013 |
| -1.610000000000072 | -0.624 | -0.173 | -0.013 |
| -1.605000000000072 | -0.629 | -0.175 | -0.013 |
| -1.600000000000072 | -0.634 | -0.177 | -0.013 |
| -1.595000000000073 | -0.639 | -0.179 | -0.014 |
| -1.590000000000073 | -0.644 | -0.181 | -0.014 |
| -1.585000000000073 | -0.648 | -0.183 | -0.014 |
| -1.580000000000073 | -0.653 | -0.185 | -0.014 |
| -1.575000000000073 | -0.658 | -0.187 | -0.015 |
| -1.570000000000073 | -0.663 | -0.189 | -0.015 |
| -1.565000000000073 | -0.669 | -0.191 | -0.015 |
| -1.560000000000073 | -0.674 | -0.193 | -0.016 |
| -1.555000000000073 | -0.679 | -0.195 | -0.016 |
| -1.550000000000074 | -0.684 | -0.198 | -0.016 |
| -1.545000000000074 | -0.689 | -0.2 | -0.017 |
| -1.540000000000074 | -0.695 | -0.202 | -0.017 |
| -1.535000000000074 | -0.7 | -0.204 | -0.017 |
| -1.530000000000074 | -0.706 | -0.206 | -0.018 |
| -1.525000000000074 | -0.711 | -0.209 | -0.018 |
| -1.520000000000074 | -0.717 | -0.211 | -0.018 |
| -1.515000000000074 | -0.722 | -0.213 | -0.019 |
| -1.510000000000074 | -0.728 | -0.216 | -0.019 |
| -1.505000000000074 | -0.734 | -0.218 | -0.02 |
| -1.500000000000075 | -0.739 | -0.221 | -0.02 |
| -1.495000000000075 | -0.745 | -0.223 | -0.02 |
| -1.490000000000075 | -0.751 | -0.225 | -0.021 |
| -1.485000000000075 | -0.757 | -0.228 | -0.021 |
| -1.480000000000075 | -0.763 | -0.231 | -0.022 |
| -1.475000000000075 | -0.769 | -0.233 | -0.022 |
| -1.470000000000075 | -0.775 | -0.236 | -0.022 |
| -1.465000000000075 | -0.782 | -0.238 | -0.023 |
| -1.460000000000075 | -0.788 | -0.241 | -0.023 |
| -1.455000000000076 | -0.794 | -0.244 | -0.024 |
| -1.450000000000076 | -0.801 | -0.246 | -0.024 |
| -1.445000000000076 | -0.807 | -0.249 | -0.025 |
| -1.440000000000076 | -0.814 | -0.252 | -0.025 |
| -1.435000000000076 | -0.82 | -0.255 | -0.026 |
| -1.430000000000076 | -0.827 | -0.258 | -0.026 |
| -1.425000000000076 | -0.834 | -0.261 | -0.027 |
| -1.420000000000076 | -0.841 | -0.264 | -0.027 |
| -1.415000000000076 | -0.848 | -0.267 | -0.028 |
| -1.410000000000077 | -0.855 | -0.27 | -0.029 |
| -1.405000000000077 | -0.862 | -0.273 | -0.029 |
| -1.400000000000077 | -0.869 | -0.276 | -0.03 |
| -1.395000000000077 | -0.876 | -0.279 | -0.03 |
| -1.390000000000077 | -0.883 | -0.282 | -0.031 |
| -1.385000000000077 | -0.891 | -0.285 | -0.032 |
| -1.380000000000077 | -0.898 | -0.289 | -0.032 |
| -1.375000000000077 | -0.906 | -0.292 | -0.033 |
| -1.370000000000077 | -0.913 | -0.295 | -0.034 |
| -1.365000000000077 | -0.921 | -0.299 | -0.034 |
| -1.360000000000078 | -0.929 | -0.302 | -0.035 |
| -1.355000000000078 | -0.937 | -0.305 | -0.036 |
| -1.350000000000078 | -0.945 | -0.309 | -0.036 |
| -1.345000000000078 | -0.953 | -0.313 | -0.037 |
| -1.340000000000078 | -0.961 | -0.316 | -0.038 |
| -1.335000000000078 | -0.969 | -0.32 | -0.039 |
| -1.330000000000078 | -0.978 | -0.323 | -0.04 |
| -1.325000000000078 | -0.986 | -0.327 | -0.04 |
| -1.320000000000078 | -0.995 | -0.331 | -0.041 |
| -1.315000000000079 | -1.003 | -0.335 | -0.042 |
| -1.310000000000079 | -1.012 | -0.339 | -0.043 |
| -1.305000000000079 | -1.021 | -0.343 | -0.044 |
| -1.300000000000079 | -1.03 | -0.347 | -0.045 |
| -1.295000000000079 | -1.039 | -0.351 | -0.046 |
| -1.29000000000008 | -1.048 | -0.355 | -0.046 |
| -1.285000000000079 | -1.057 | -0.359 | -0.047 |
| -1.280000000000079 | -1.067 | -0.363 | -0.048 |
| -1.275000000000079 | -1.076 | -0.367 | -0.049 |
| -1.270000000000079 | -1.086 | -0.372 | -0.05 |
| -1.26500000000008 | -1.096 | -0.376 | -0.051 |
| -1.26000000000008 | -1.106 | -0.381 | -0.052 |
| -1.25500000000008 | -1.116 | -0.385 | -0.054 |
| -1.25000000000008 | -1.126 | -0.39 | -0.055 |
| -1.24500000000008 | -1.136 | -0.394 | -0.056 |
| -1.24000000000008 | -1.146 | -0.399 | -0.057 |
| -1.23500000000008 | -1.157 | -0.404 | -0.058 |
| -1.23000000000008 | -1.167 | -0.409 | -0.059 |
| -1.22500000000008 | -1.178 | -0.413 | -0.06 |
| -1.220000000000081 | -1.189 | -0.418 | -0.062 |
| -1.215000000000081 | -1.2 | -0.423 | -0.063 |
| -1.210000000000081 | -1.211 | -0.429 | -0.064 |
| -1.205000000000081 | -1.222 | -0.434 | -0.066 |
| -1.200000000000081 | -1.234 | -0.439 | -0.067 |
| -1.195000000000081 | -1.245 | -0.444 | -0.068 |
| -1.190000000000081 | -1.257 | -0.45 | -0.07 |
| -1.185000000000081 | -1.269 | -0.455 | -0.071 |
| -1.180000000000081 | -1.281 | -0.461 | -0.073 |
| -1.175000000000082 | -1.293 | -0.466 | -0.074 |
| -1.170000000000082 | -1.305 | -0.472 | -0.076 |
| -1.165000000000082 | -1.318 | -0.478 | -0.077 |
| -1.160000000000082 | -1.33 | -0.483 | -0.079 |
| -1.155000000000082 | -1.343 | -0.489 | -0.08 |
| -1.150000000000082 | -1.356 | -0.495 | -0.082 |
| -1.145000000000082 | -1.369 | -0.501 | -0.084 |
| -1.140000000000082 | -1.383 | -0.508 | -0.085 |
| -1.135000000000082 | -1.396 | -0.514 | -0.087 |
| -1.130000000000082 | -1.41 | -0.52 | -0.089 |
| -1.125000000000083 | -1.424 | -0.527 | -0.091 |
| -1.120000000000083 | -1.438 | -0.533 | -0.093 |
| -1.115000000000083 | -1.452 | -0.54 | -0.095 |
| -1.110000000000083 | -1.466 | -0.547 | -0.097 |
| -1.105000000000083 | -1.481 | -0.554 | -0.099 |
| -1.100000000000083 | -1.496 | -0.561 | -0.101 |
| -1.095000000000083 | -1.511 | -0.568 | -0.103 |
| -1.090000000000083 | -1.526 | -0.575 | -0.105 |
| -1.085000000000083 | -1.542 | -0.582 | -0.107 |
| -1.080000000000084 | -1.557 | -0.589 | -0.109 |
| -1.075000000000084 | -1.573 | -0.597 | -0.112 |
| -1.070000000000084 | -1.589 | -0.604 | -0.114 |
| -1.065000000000084 | -1.606 | -0.612 | -0.116 |
| -1.060000000000084 | -1.622 | -0.62 | -0.119 |
| -1.055000000000084 | -1.639 | -0.628 | -0.121 |
| -1.050000000000084 | -1.656 | -0.636 | -0.124 |
| -1.045000000000084 | -1.674 | -0.644 | -0.126 |
| -1.040000000000084 | -1.691 | -0.653 | -0.129 |
| -1.035000000000085 | -1.709 | -0.661 | -0.132 |
| -1.030000000000085 | -1.727 | -0.67 | -0.134 |
| -1.025000000000085 | -1.745 | -0.678 | -0.137 |
| -1.020000000000085 | -1.764 | -0.687 | -0.14 |
| -1.015000000000085 | -1.783 | -0.696 | -0.143 |
| -1.010000000000085 | -1.802 | -0.705 | -0.146 |
| -1.005000000000085 | -1.822 | -0.715 | -0.149 |
| -1.000000000000085 | -1.841 | -0.724 | -0.152 |
| -0.995000000000085 | -1.861 | -0.734 | -0.155 |
| -0.990000000000085 | -1.882 | -0.743 | -0.158 |
| -0.985000000000085 | -1.902 | -0.753 | -0.162 |
| -0.980000000000085 | -1.924 | -0.763 | -0.165 |
| -0.975000000000085 | -1.945 | -0.774 | -0.169 |
| -0.970000000000085 | -1.967 | -0.784 | -0.172 |
| -0.965000000000085 | -1.989 | -0.794 | -0.176 |
| -0.960000000000085 | -2.011 | -0.805 | -0.18 |
| -0.955000000000085 | -2.034 | -0.816 | -0.183 |
| -0.950000000000085 | -2.057 | -0.827 | -0.187 |
| -0.945000000000085 | -2.08 | -0.838 | -0.191 |
| -0.940000000000085 | -2.104 | -0.85 | -0.195 |
| -0.935000000000085 | -2.128 | -0.862 | -0.199 |
| -0.930000000000085 | -2.153 | -0.873 | -0.204 |
| -0.925000000000085 | -2.178 | -0.886 | -0.208 |
| -0.920000000000085 | -2.203 | -0.898 | -0.212 |
| -0.915000000000085 | -2.229 | -0.91 | -0.217 |
| -0.910000000000085 | -2.255 | -0.923 | -0.221 |
| -0.905000000000085 | -2.282 | -0.936 | -0.226 |
| -0.900000000000085 | -2.309 | -0.949 | -0.231 |
| -0.895000000000085 | -2.337 | -0.962 | -0.236 |
| -0.890000000000085 | -2.365 | -0.976 | -0.241 |
| -0.885000000000085 | -2.393 | -0.99 | -0.246 |
| -0.880000000000085 | -2.422 | -1.004 | -0.251 |
| -0.875000000000085 | -2.452 | -1.018 | -0.257 |
| -0.870000000000085 | -2.482 | -1.033 | -0.262 |
| -0.865000000000085 | -2.512 | -1.048 | -0.268 |
| -0.860000000000085 | -2.543 | -1.063 | -0.274 |
| -0.855000000000085 | -2.575 | -1.078 | -0.28 |
| -0.850000000000085 | -2.607 | -1.094 | -0.286 |
| -0.845000000000085 | -2.64 | -1.11 | -0.292 |
| -0.840000000000085 | -2.674 | -1.126 | -0.298 |
| -0.835000000000085 | -2.708 | -1.143 | -0.305 |
| -0.830000000000085 | -2.742 | -1.16 | -0.311 |
| -0.825000000000085 | -2.777 | -1.177 | -0.318 |
| -0.820000000000085 | -2.813 | -1.194 | -0.325 |
| -0.815000000000085 | -2.85 | -1.212 | -0.332 |
| -0.810000000000085 | -2.887 | -1.23 | -0.339 |
| -0.805000000000085 | -2.925 | -1.249 | -0.347 |
| -0.800000000000085 | -2.964 | -1.268 | -0.354 |
| -0.795000000000085 | -3.003 | -1.287 | -0.362 |
| -0.790000000000085 | -3.043 | -1.307 | -0.37 |
| -0.785000000000085 | -3.084 | -1.327 | -0.378 |
| -0.780000000000085 | -3.126 | -1.347 | -0.387 |
| -0.775000000000085 | -3.168 | -1.368 | -0.395 |
| -0.770000000000085 | -3.211 | -1.389 | -0.404 |
| -0.765000000000085 | -3.256 | -1.411 | -0.413 |
| -0.760000000000085 | -3.301 | -1.433 | -0.422 |
| -0.755000000000085 | -3.347 | -1.456 | -0.431 |
| -0.750000000000085 | -3.393 | -1.479 | -0.441 |
| -0.745000000000085 | -3.441 | -1.502 | -0.451 |
| -0.740000000000085 | -3.49 | -1.526 | -0.461 |
| -0.735000000000085 | -3.54 | -1.551 | -0.471 |
| -0.730000000000085 | -3.591 | -1.576 | -0.482 |
| -0.725000000000085 | -3.643 | -1.601 | -0.493 |
| -0.720000000000085 | -3.696 | -1.628 | -0.504 |
| -0.715000000000085 | -3.75 | -1.654 | -0.516 |
| -0.710000000000085 | -3.805 | -1.681 | -0.527 |
| -0.705000000000085 | -3.861 | -1.709 | -0.539 |
| -0.700000000000085 | -3.919 | -1.738 | -0.552 |
| -0.695000000000085 | -3.978 | -1.767 | -0.564 |
| -0.690000000000085 | -4.038 | -1.797 | -0.577 |
| -0.685000000000085 | -4.1 | -1.827 | -0.59 |
| -0.680000000000085 | -4.162 | -1.858 | -0.604 |
| -0.675000000000085 | -4.227 | -1.89 | -0.618 |
| -0.670000000000085 | -4.292 | -1.922 | -0.632 |
| -0.665000000000085 | -4.36 | -1.955 | -0.647 |
| -0.660000000000085 | -4.428 | -1.989 | -0.662 |
| -0.655000000000085 | -4.499 | -2.024 | -0.677 |
| -0.650000000000085 | -4.571 | -2.06 | -0.693 |
| -0.645000000000085 | -4.644 | -2.096 | -0.71 |
| -0.640000000000085 | -4.72 | -2.134 | -0.726 |
| -0.635000000000085 | -4.797 | -2.172 | -0.744 |
| -0.630000000000085 | -4.876 | -2.211 | -0.761 |
| -0.625000000000085 | -4.957 | -2.251 | -0.779 |
| -0.620000000000085 | -5.039 | -2.292 | -0.798 |
| -0.615000000000085 | -5.124 | -2.334 | -0.817 |
| -0.610000000000085 | -5.211 | -2.378 | -0.837 |
| -0.605000000000085 | -5.3 | -2.422 | -0.857 |
| -0.600000000000085 | -5.392 | -2.467 | -0.878 |
| -0.595000000000085 | -5.486 | -2.514 | -0.899 |
| -0.590000000000085 | -5.582 | -2.561 | -0.921 |
| -0.585000000000085 | -5.68 | -2.61 | -0.944 |
| -0.580000000000085 | -5.781 | -2.661 | -0.967 |
| -0.575000000000085 | -5.885 | -2.712 | -0.991 |
| -0.570000000000085 | -5.992 | -2.765 | -1.015 |
| -0.565000000000085 | -6.101 | -2.82 | -1.041 |
| -0.560000000000085 | -6.213 | -2.875 | -1.067 |
| -0.555000000000085 | -6.329 | -2.933 | -1.094 |
| -0.550000000000085 | -6.447 | -2.992 | -1.121 |
| -0.545000000000085 | -6.569 | -3.052 | -1.15 |
| -0.540000000000085 | -6.694 | -3.115 | -1.179 |
| -0.535000000000085 | -6.823 | -3.179 | -1.209 |
| -0.530000000000085 | -6.956 | -3.245 | -1.24 |
| -0.525000000000085 | -7.092 | -3.312 | -1.272 |
| -0.520000000000085 | -7.232 | -3.382 | -1.305 |
| -0.515000000000085 | -7.376 | -3.454 | -1.339 |
| -0.510000000000085 | -7.525 | -3.528 | -1.374 |
| -0.505000000000085 | -7.678 | -3.604 | -1.411 |
| -0.500000000000085 | -7.835 | -3.683 | -1.448 |
| -0.495000000000085 | -7.998 | -3.764 | -1.487 |
| -0.490000000000085 | -8.165 | -3.847 | -1.527 |
| -0.485000000000085 | -8.338 | -3.933 | -1.568 |
| -0.480000000000085 | -8.516 | -4.022 | -1.61 |
| -0.475000000000085 | -8.699 | -4.113 | -1.654 |
| -0.470000000000085 | -8.889 | -4.208 | -1.7 |
| -0.465000000000085 | -9.085 | -4.305 | -1.747 |
| -0.460000000000085 | -9.287 | -4.406 | -1.796 |
| -0.455000000000085 | -9.496 | -4.51 | -1.846 |
| -0.450000000000085 | -9.712 | -4.618 | -1.898 |
| -0.445000000000085 | -9.935 | -4.729 | -1.952 |
| -0.440000000000085 | -10.166 | -4.844 | -2.008 |
| -0.435000000000085 | -10.404 | -4.964 | -2.066 |
| -0.430000000000085 | -10.652 | -5.087 | -2.126 |
| -0.425000000000085 | -10.907 | -5.215 | -2.188 |
| -0.420000000000085 | -11.173 | -5.347 | -2.252 |
| -0.415000000000085 | -11.447 | -5.484 | -2.319 |
| -0.410000000000085 | -11.732 | -5.626 | -2.389 |
| -0.405000000000085 | -12.028 | -5.774 | -2.461 |
| -0.400000000000085 | -12.335 | -5.927 | -2.536 |
| -0.395000000000085 | -12.653 | -6.086 | -2.614 |
| -0.390000000000085 | -12.984 | -6.251 | -2.695 |
| -0.385000000000085 | -13.328 | -6.423 | -2.779 |
| -0.380000000000085 | -13.685 | -6.601 | -2.866 |
| -0.375000000000085 | -14.057 | -6.787 | -2.958 |
| -0.370000000000085 | -14.444 | -6.98 | -3.053 |
| -0.365000000000085 | -14.847 | -7.181 | -3.152 |
| -0.360000000000085 | -15.267 | -7.391 | -3.255 |
| -0.355000000000085 | -15.704 | -7.61 | -3.363 |
| -0.350000000000085 | -16.161 | -7.838 | -3.476 |
| -0.345000000000085 | -16.638 | -8.076 | -3.593 |
| -0.340000000000085 | -17.135 | -8.325 | -3.716 |
| -0.335000000000085 | -17.656 | -8.585 | -3.845 |
| -0.330000000000085 | -18.2 | -8.857 | -3.979 |
| -0.325000000000085 | -18.769 | -9.141 | -4.12 |
| -0.320000000000085 | -19.365 | -9.439 | -4.267 |
| -0.315000000000085 | -19.99 | -9.751 | -4.422 |
| -0.310000000000085 | -20.646 | -10.079 | -4.585 |
| -0.305000000000085 | -21.334 | -10.423 | -4.755 |
| -0.300000000000085 | -22.056 | -10.784 | -4.934 |
| -0.295000000000085 | -22.816 | -11.163 | -5.123 |
| -0.290000000000085 | -23.615 | -11.563 | -5.321 |
| -0.285000000000085 | -24.457 | -11.983 | -5.53 |
| -0.280000000000085 | -25.344 | -12.427 | -5.751 |
| -0.275000000000085 | -26.28 | -12.895 | -5.983 |
| -0.270000000000085 | -27.269 | -13.389 | -6.229 |
| -0.265000000000085 | -28.314 | -13.911 | -6.489 |
| -0.260000000000085 | -29.42 | -14.464 | -6.764 |
| -0.255000000000085 | -30.591 | -15.05 | -7.056 |
| -0.250000000000085 | -31.834 | -15.671 | -7.365 |
| -0.245000000000085 | -33.153 | -16.33 | -7.694 |
| -0.240000000000085 | -34.556 | -17.032 | -8.044 |
| -0.235000000000085 | -36.049 | -17.778 | -8.416 |
| -0.230000000000085 | -37.641 | -18.574 | -8.812 |
| -0.225000000000085 | -39.34 | -19.423 | -9.236 |
| -0.220000000000085 | -41.156 | -20.331 | -9.689 |
| -0.215000000000085 | -43.1 | -21.303 | -10.174 |
| -0.210000000000085 | -45.185 | -22.345 | -10.694 |
| -0.205000000000085 | -47.424 | -23.465 | -11.253 |
| -0.200000000000085 | -49.834 | -24.669 | -11.854 |
| -0.195000000000085 | -52.431 | -25.968 | -12.502 |
| -0.190000000000085 | -55.235 | -27.37 | -13.203 |
| -0.185000000000085 | -58.27 | -28.887 | -13.96 |
| -0.180000000000085 | -61.562 | -30.533 | -14.782 |
| -0.175000000000085 | -65.14 | -32.322 | -15.676 |
| -0.170000000000085 | -69.038 | -34.271 | -16.65 |
| -0.165000000000085 | -73.295 | -36.399 | -17.713 |
| -0.160000000000085 | -77.959 | -38.731 | -18.878 |
| -0.155000000000084 | -83.08 | -41.292 | -20.158 |
| -0.150000000000084 | -88.722 | -44.113 | -21.567 |
| -0.145000000000084 | -94.958 | -47.23 | -23.126 |
| -0.140000000000084 | -101.874 | -50.688 | -24.854 |
| -0.135000000000084 | -109.573 | -54.538 | -26.778 |
| -0.130000000000084 | -118.177 | -58.839 | -28.928 |
| -0.125000000000084 | -127.833 | -63.668 | -31.342 |
| -0.120000000000084 | -138.722 | -69.112 | -34.063 |
| -0.115000000000084 | -151.062 | -75.282 | -37.148 |
| -0.110000000000084 | -165.123 | -82.312 | -40.662 |
| -0.105000000000084 | -181.239 | -90.37 | -44.691 |
| -0.100000000000084 | -199.833 | -99.667 | -49.339 |
| -0.0950000000000844 | -221.44 | -110.471 | -54.74 |
| -0.0900000000000844 | -246.747 | -123.124 | -61.066 |
| -0.0850000000000844 | -276.65 | -138.075 | -68.541 |
| -0.0800000000000844 | -312.333 | -155.917 | -77.462 |
| -0.0750000000000844 | -355.389 | -177.445 | -88.225 |
| -0.0700000000000844 | -407.997 | -203.749 | -101.377 |
| -0.0650000000000844 | -473.206 | -236.353 | -117.679 |
| -0.0600000000000844 | -555.389 | -277.445 | -138.224 |
| -0.0550000000000844 | -660.99 | -330.245 | -164.624 |
| -0.0500000000000844 | -799.833 | -399.667 | -199.335 |
| -0.0450000000000844 | -987.488 | -493.494 | -246.248 |
| -0.0400000000000844 | -1249.833 | -624.667 | -311.834 |
| -0.0350000000000844 | -1632.486 | -815.993 | -407.497 |
| -0.0300000000000844 | -2222.056 | -1110.778 | -554.889 |
| -0.0250000000000844 | -3199.833 | -1599.667 | -799.334 |
| -0.0200000000000844 | -4999.833 | -2499.667 | -1249.334 |
| -0.0150000000000844 | -8888.722 | -4444.111 | -2221.556 |
| -0.0100000000000844 | -19999.833 | -9999.667 | -4999.333 |
| -0.00500000000008444 | -79999.833 | -39999.667 | -19999.333 |
| -8.4444604087075e-14 | -280919800604594001942675456 | -140275266868023000341413888 | -70091543319643096034050048 |
| 0.00499999999991555 | -79999.833 | -39999.667 | -19999.333 |
| 0.00999999999991555 | -19999.833 | -9999.667 | -4999.333 |
| 0.0149999999999156 | -8888.722 | -4444.111 | -2221.556 |
| 0.0199999999999156 | -4999.833 | -2499.667 | -1249.334 |
| 0.0249999999999156 | -3199.833 | -1599.667 | -799.334 |
| 0.0299999999999156 | -2222.056 | -1110.778 | -554.889 |
| 0.0349999999999155 | -1632.486 | -815.993 | -407.497 |
| 0.0399999999999155 | -1249.833 | -624.667 | -311.834 |
| 0.0449999999999155 | -987.488 | -493.494 | -246.248 |
| 0.0499999999999155 | -799.833 | -399.667 | -199.335 |
| 0.0549999999999155 | -660.99 | -330.245 | -164.624 |
| 0.0599999999999155 | -555.389 | -277.445 | -138.224 |
| 0.0649999999999155 | -473.206 | -236.353 | -117.679 |
| 0.0699999999999155 | -407.997 | -203.749 | -101.377 |
| 0.0749999999999155 | -355.389 | -177.445 | -88.225 |
| 0.0799999999999155 | -312.333 | -155.917 | -77.462 |
| 0.0849999999999155 | -276.65 | -138.075 | -68.541 |
| 0.0899999999999155 | -246.747 | -123.124 | -61.066 |
| 0.0949999999999155 | -221.44 | -110.471 | -54.74 |
| 0.0999999999999155 | -199.833 | -99.667 | -49.339 |
| 0.104999999999916 | -181.239 | -90.37 | -44.691 |
| 0.109999999999916 | -165.123 | -82.312 | -40.662 |
| 0.114999999999916 | -151.062 | -75.282 | -37.148 |
| 0.119999999999916 | -138.722 | -69.112 | -34.063 |
| 0.124999999999916 | -127.833 | -63.668 | -31.342 |
| 0.129999999999916 | -118.177 | -58.839 | -28.928 |
| 0.134999999999916 | -109.573 | -54.538 | -26.778 |
| 0.139999999999916 | -101.874 | -50.688 | -24.854 |
| 0.144999999999916 | -94.958 | -47.23 | -23.126 |
| 0.149999999999916 | -88.722 | -44.113 | -21.567 |
| 0.154999999999916 | -83.08 | -41.292 | -20.158 |
| 0.159999999999916 | -77.959 | -38.731 | -18.878 |
| 0.164999999999916 | -73.295 | -36.399 | -17.713 |
| 0.169999999999916 | -69.038 | -34.271 | -16.65 |
| 0.174999999999916 | -65.14 | -32.322 | -15.676 |
| 0.179999999999916 | -61.562 | -30.533 | -14.782 |
| 0.184999999999916 | -58.27 | -28.887 | -13.96 |
| 0.189999999999916 | -55.235 | -27.37 | -13.203 |
| 0.194999999999916 | -52.431 | -25.968 | -12.502 |
| 0.199999999999916 | -49.834 | -24.669 | -11.854 |
| 0.204999999999916 | -47.424 | -23.465 | -11.253 |
| 0.209999999999916 | -45.185 | -22.345 | -10.694 |
| 0.214999999999916 | -43.1 | -21.303 | -10.174 |
| 0.219999999999916 | -41.156 | -20.331 | -9.689 |
| 0.224999999999916 | -39.34 | -19.423 | -9.236 |
| 0.229999999999916 | -37.641 | -18.574 | -8.812 |
| 0.234999999999916 | -36.049 | -17.778 | -8.416 |
| 0.239999999999916 | -34.556 | -17.032 | -8.044 |
| 0.244999999999916 | -33.153 | -16.33 | -7.694 |
| 0.249999999999916 | -31.834 | -15.671 | -7.365 |
| 0.254999999999916 | -30.591 | -15.05 | -7.056 |
| 0.259999999999916 | -29.42 | -14.464 | -6.764 |
| 0.264999999999916 | -28.314 | -13.911 | -6.489 |
| 0.269999999999916 | -27.269 | -13.389 | -6.229 |
| 0.274999999999916 | -26.28 | -12.895 | -5.983 |
| 0.279999999999916 | -25.344 | -12.427 | -5.751 |
| 0.284999999999916 | -24.457 | -11.983 | -5.53 |
| 0.289999999999916 | -23.615 | -11.563 | -5.321 |
| 0.294999999999916 | -22.816 | -11.163 | -5.123 |
| 0.299999999999916 | -22.056 | -10.784 | -4.934 |
| 0.304999999999916 | -21.334 | -10.423 | -4.755 |
| 0.309999999999916 | -20.646 | -10.079 | -4.585 |
| 0.314999999999916 | -19.99 | -9.751 | -4.422 |
| 0.319999999999916 | -19.365 | -9.439 | -4.267 |
| 0.324999999999916 | -18.769 | -9.141 | -4.12 |
| 0.329999999999916 | -18.2 | -8.857 | -3.979 |
| 0.334999999999916 | -17.656 | -8.585 | -3.845 |
| 0.339999999999916 | -17.135 | -8.325 | -3.716 |
| 0.344999999999916 | -16.638 | -8.076 | -3.593 |
| 0.349999999999916 | -16.161 | -7.838 | -3.476 |
| 0.354999999999916 | -15.704 | -7.61 | -3.363 |
| 0.359999999999916 | -15.267 | -7.391 | -3.255 |
| 0.364999999999916 | -14.847 | -7.181 | -3.152 |
| 0.369999999999916 | -14.444 | -6.98 | -3.053 |
| 0.374999999999916 | -14.057 | -6.787 | -2.958 |
| 0.379999999999916 | -13.685 | -6.601 | -2.866 |
| 0.384999999999916 | -13.328 | -6.423 | -2.779 |
| 0.389999999999916 | -12.984 | -6.251 | -2.695 |
| 0.394999999999916 | -12.653 | -6.086 | -2.614 |
| 0.399999999999916 | -12.335 | -5.927 | -2.536 |
| 0.404999999999916 | -12.028 | -5.774 | -2.461 |
| 0.409999999999916 | -11.732 | -5.626 | -2.389 |
| 0.414999999999916 | -11.447 | -5.484 | -2.319 |
| 0.419999999999916 | -11.173 | -5.347 | -2.252 |
| 0.424999999999916 | -10.907 | -5.215 | -2.188 |
| 0.429999999999916 | -10.652 | -5.087 | -2.126 |
| 0.434999999999916 | -10.404 | -4.964 | -2.066 |
| 0.439999999999916 | -10.166 | -4.844 | -2.008 |
| 0.444999999999916 | -9.935 | -4.729 | -1.952 |
| 0.449999999999916 | -9.712 | -4.618 | -1.898 |
| 0.454999999999916 | -9.496 | -4.51 | -1.846 |
| 0.459999999999916 | -9.287 | -4.406 | -1.796 |
| 0.464999999999916 | -9.085 | -4.305 | -1.747 |
| 0.469999999999916 | -8.889 | -4.208 | -1.7 |
| 0.474999999999916 | -8.699 | -4.113 | -1.654 |
| 0.479999999999916 | -8.516 | -4.022 | -1.61 |
| 0.484999999999916 | -8.338 | -3.933 | -1.568 |
| 0.489999999999916 | -8.165 | -3.847 | -1.527 |
| 0.494999999999916 | -7.998 | -3.764 | -1.487 |
| 0.499999999999916 | -7.835 | -3.683 | -1.448 |
| 0.504999999999916 | -7.678 | -3.604 | -1.411 |
| 0.509999999999916 | -7.525 | -3.528 | -1.374 |
| 0.514999999999916 | -7.376 | -3.454 | -1.339 |
| 0.519999999999916 | -7.232 | -3.382 | -1.305 |
| 0.524999999999916 | -7.092 | -3.312 | -1.272 |
| 0.529999999999916 | -6.956 | -3.245 | -1.24 |
| 0.534999999999916 | -6.823 | -3.179 | -1.209 |
| 0.539999999999916 | -6.694 | -3.115 | -1.179 |
| 0.544999999999916 | -6.569 | -3.052 | -1.15 |
| 0.549999999999916 | -6.447 | -2.992 | -1.121 |
| 0.554999999999916 | -6.329 | -2.933 | -1.094 |
| 0.559999999999916 | -6.213 | -2.875 | -1.067 |
| 0.564999999999916 | -6.101 | -2.82 | -1.041 |
| 0.569999999999916 | -5.992 | -2.765 | -1.015 |
| 0.574999999999916 | -5.885 | -2.712 | -0.991 |
| 0.579999999999916 | -5.781 | -2.661 | -0.967 |
| 0.584999999999916 | -5.68 | -2.61 | -0.944 |
| 0.589999999999916 | -5.582 | -2.561 | -0.921 |
| 0.594999999999916 | -5.486 | -2.514 | -0.899 |
| 0.599999999999916 | -5.392 | -2.467 | -0.878 |
| 0.604999999999916 | -5.3 | -2.422 | -0.857 |
| 0.609999999999916 | -5.211 | -2.378 | -0.837 |
| 0.614999999999916 | -5.124 | -2.334 | -0.817 |
| 0.619999999999916 | -5.039 | -2.292 | -0.798 |
| 0.624999999999916 | -4.957 | -2.251 | -0.779 |
| 0.629999999999916 | -4.876 | -2.211 | -0.761 |
| 0.634999999999916 | -4.797 | -2.172 | -0.744 |
| 0.639999999999916 | -4.72 | -2.134 | -0.726 |
| 0.644999999999916 | -4.644 | -2.096 | -0.71 |
| 0.649999999999916 | -4.571 | -2.06 | -0.693 |
| 0.654999999999916 | -4.499 | -2.024 | -0.677 |
| 0.659999999999916 | -4.428 | -1.989 | -0.662 |
| 0.664999999999916 | -4.36 | -1.955 | -0.647 |
| 0.669999999999916 | -4.292 | -1.922 | -0.632 |
| 0.674999999999916 | -4.227 | -1.89 | -0.618 |
| 0.679999999999916 | -4.162 | -1.858 | -0.604 |
| 0.684999999999916 | -4.1 | -1.827 | -0.59 |
| 0.689999999999916 | -4.038 | -1.797 | -0.577 |
| 0.694999999999916 | -3.978 | -1.767 | -0.564 |
| 0.699999999999916 | -3.919 | -1.738 | -0.552 |
| 0.704999999999916 | -3.861 | -1.709 | -0.539 |
| 0.709999999999916 | -3.805 | -1.681 | -0.527 |
| 0.714999999999916 | -3.75 | -1.654 | -0.516 |
| 0.719999999999916 | -3.696 | -1.628 | -0.504 |
| 0.724999999999916 | -3.643 | -1.601 | -0.493 |
| 0.729999999999916 | -3.591 | -1.576 | -0.482 |
| 0.734999999999916 | -3.54 | -1.551 | -0.471 |
| 0.739999999999916 | -3.49 | -1.526 | -0.461 |
| 0.744999999999916 | -3.441 | -1.502 | -0.451 |
| 0.749999999999916 | -3.393 | -1.479 | -0.441 |
| 0.754999999999916 | -3.347 | -1.456 | -0.431 |
| 0.759999999999916 | -3.301 | -1.433 | -0.422 |
| 0.764999999999916 | -3.256 | -1.411 | -0.413 |
| 0.769999999999916 | -3.211 | -1.389 | -0.404 |
| 0.774999999999916 | -3.168 | -1.368 | -0.395 |
| 0.779999999999916 | -3.126 | -1.347 | -0.387 |
| 0.784999999999916 | -3.084 | -1.327 | -0.378 |
| 0.789999999999916 | -3.043 | -1.307 | -0.37 |
| 0.794999999999916 | -3.003 | -1.287 | -0.362 |
| 0.799999999999916 | -2.964 | -1.268 | -0.354 |
| 0.804999999999916 | -2.925 | -1.249 | -0.347 |
| 0.809999999999916 | -2.887 | -1.23 | -0.339 |
| 0.814999999999916 | -2.85 | -1.212 | -0.332 |
| 0.819999999999916 | -2.813 | -1.194 | -0.325 |
| 0.824999999999916 | -2.777 | -1.177 | -0.318 |
| 0.829999999999916 | -2.742 | -1.16 | -0.311 |
| 0.834999999999916 | -2.708 | -1.143 | -0.305 |
| 0.839999999999916 | -2.674 | -1.126 | -0.298 |
| 0.844999999999916 | -2.64 | -1.11 | -0.292 |
| 0.849999999999916 | -2.607 | -1.094 | -0.286 |
| 0.854999999999916 | -2.575 | -1.078 | -0.28 |
| 0.859999999999916 | -2.543 | -1.063 | -0.274 |
| 0.864999999999916 | -2.512 | -1.048 | -0.268 |
| 0.869999999999916 | -2.482 | -1.033 | -0.262 |
| 0.874999999999916 | -2.452 | -1.018 | -0.257 |
| 0.879999999999916 | -2.422 | -1.004 | -0.251 |
| 0.884999999999916 | -2.393 | -0.99 | -0.246 |
| 0.889999999999916 | -2.365 | -0.976 | -0.241 |
| 0.894999999999916 | -2.337 | -0.962 | -0.236 |
| 0.899999999999916 | -2.309 | -0.949 | -0.231 |
| 0.904999999999916 | -2.282 | -0.936 | -0.226 |
| 0.909999999999916 | -2.255 | -0.923 | -0.221 |
| 0.914999999999916 | -2.229 | -0.91 | -0.217 |
| 0.919999999999916 | -2.203 | -0.898 | -0.212 |
| 0.924999999999916 | -2.178 | -0.886 | -0.208 |
| 0.929999999999916 | -2.153 | -0.873 | -0.204 |
| 0.934999999999916 | -2.128 | -0.862 | -0.199 |
| 0.939999999999916 | -2.104 | -0.85 | -0.195 |
| 0.944999999999916 | -2.08 | -0.838 | -0.191 |
| 0.949999999999916 | -2.057 | -0.827 | -0.187 |
| 0.954999999999916 | -2.034 | -0.816 | -0.183 |
| 0.959999999999916 | -2.011 | -0.805 | -0.18 |
| 0.964999999999916 | -1.989 | -0.794 | -0.176 |
| 0.969999999999916 | -1.967 | -0.784 | -0.172 |
| 0.974999999999916 | -1.945 | -0.774 | -0.169 |
| 0.979999999999916 | -1.924 | -0.763 | -0.165 |
| 0.984999999999916 | -1.902 | -0.753 | -0.162 |
| 0.989999999999916 | -1.882 | -0.743 | -0.158 |
| 0.994999999999916 | -1.861 | -0.734 | -0.155 |
| 0.999999999999916 | -1.841 | -0.724 | -0.152 |
| 1.004999999999916 | -1.822 | -0.715 | -0.149 |
| 1.009999999999916 | -1.802 | -0.705 | -0.146 |
| 1.014999999999916 | -1.783 | -0.696 | -0.143 |
| 1.019999999999916 | -1.764 | -0.687 | -0.14 |
| 1.024999999999916 | -1.745 | -0.678 | -0.137 |
| 1.029999999999916 | -1.727 | -0.67 | -0.134 |
| 1.034999999999916 | -1.709 | -0.661 | -0.132 |
| 1.039999999999915 | -1.691 | -0.653 | -0.129 |
| 1.044999999999915 | -1.674 | -0.644 | -0.126 |
| 1.049999999999915 | -1.656 | -0.636 | -0.124 |
| 1.054999999999915 | -1.639 | -0.628 | -0.121 |
| 1.059999999999915 | -1.622 | -0.62 | -0.119 |
| 1.064999999999915 | -1.606 | -0.612 | -0.116 |
| 1.069999999999915 | -1.589 | -0.604 | -0.114 |
| 1.074999999999915 | -1.573 | -0.597 | -0.112 |
| 1.079999999999915 | -1.557 | -0.589 | -0.109 |
| 1.084999999999914 | -1.542 | -0.582 | -0.107 |
| 1.089999999999914 | -1.526 | -0.575 | -0.105 |
| 1.094999999999914 | -1.511 | -0.568 | -0.103 |
| 1.099999999999914 | -1.496 | -0.561 | -0.101 |
| 1.104999999999914 | -1.481 | -0.554 | -0.099 |
| 1.109999999999914 | -1.466 | -0.547 | -0.097 |
| 1.114999999999914 | -1.452 | -0.54 | -0.095 |
| 1.119999999999914 | -1.438 | -0.533 | -0.093 |
| 1.124999999999914 | -1.424 | -0.527 | -0.091 |
| 1.129999999999914 | -1.41 | -0.52 | -0.089 |
| 1.134999999999913 | -1.396 | -0.514 | -0.087 |
| 1.139999999999913 | -1.383 | -0.508 | -0.085 |
| 1.144999999999913 | -1.369 | -0.501 | -0.084 |
| 1.149999999999913 | -1.356 | -0.495 | -0.082 |
| 1.154999999999913 | -1.343 | -0.489 | -0.08 |
| 1.159999999999913 | -1.33 | -0.483 | -0.079 |
| 1.164999999999913 | -1.318 | -0.478 | -0.077 |
| 1.169999999999913 | -1.305 | -0.472 | -0.076 |
| 1.174999999999913 | -1.293 | -0.466 | -0.074 |
| 1.179999999999912 | -1.281 | -0.461 | -0.073 |
| 1.184999999999912 | -1.269 | -0.455 | -0.071 |
| 1.189999999999912 | -1.257 | -0.45 | -0.07 |
| 1.194999999999912 | -1.245 | -0.444 | -0.068 |
| 1.199999999999912 | -1.234 | -0.439 | -0.067 |
| 1.204999999999912 | -1.222 | -0.434 | -0.066 |
| 1.209999999999912 | -1.211 | -0.429 | -0.064 |
| 1.214999999999912 | -1.2 | -0.423 | -0.063 |
| 1.219999999999912 | -1.189 | -0.418 | -0.062 |
| 1.224999999999911 | -1.178 | -0.413 | -0.06 |
| 1.229999999999911 | -1.167 | -0.409 | -0.059 |
| 1.234999999999911 | -1.157 | -0.404 | -0.058 |
| 1.239999999999911 | -1.146 | -0.399 | -0.057 |
| 1.244999999999911 | -1.136 | -0.394 | -0.056 |
| 1.249999999999911 | -1.126 | -0.39 | -0.055 |
| 1.254999999999911 | -1.116 | -0.385 | -0.054 |
| 1.259999999999911 | -1.106 | -0.381 | -0.052 |
| 1.264999999999911 | -1.096 | -0.376 | -0.051 |
| 1.269999999999911 | -1.086 | -0.372 | -0.05 |
| 1.27499999999991 | -1.076 | -0.367 | -0.049 |
| 1.27999999999991 | -1.067 | -0.363 | -0.048 |
| 1.28499999999991 | -1.057 | -0.359 | -0.047 |
| 1.28999999999991 | -1.048 | -0.355 | -0.046 |
| 1.29499999999991 | -1.039 | -0.351 | -0.046 |
| 1.29999999999991 | -1.03 | -0.347 | -0.045 |
| 1.30499999999991 | -1.021 | -0.343 | -0.044 |
| 1.30999999999991 | -1.012 | -0.339 | -0.043 |
| 1.31499999999991 | -1.003 | -0.335 | -0.042 |
| 1.319999999999909 | -0.995 | -0.331 | -0.041 |
| 1.324999999999909 | -0.986 | -0.327 | -0.04 |
| 1.329999999999909 | -0.978 | -0.323 | -0.04 |
| 1.334999999999909 | -0.969 | -0.32 | -0.039 |
| 1.339999999999909 | -0.961 | -0.316 | -0.038 |
| 1.344999999999909 | -0.953 | -0.313 | -0.037 |
| 1.349999999999909 | -0.945 | -0.309 | -0.036 |
| 1.354999999999909 | -0.937 | -0.305 | -0.036 |
| 1.359999999999909 | -0.929 | -0.302 | -0.035 |
| 1.364999999999908 | -0.921 | -0.299 | -0.034 |
| 1.369999999999908 | -0.913 | -0.295 | -0.034 |
| 1.374999999999908 | -0.906 | -0.292 | -0.033 |
| 1.379999999999908 | -0.898 | -0.289 | -0.032 |
| 1.384999999999908 | -0.891 | -0.285 | -0.032 |
| 1.389999999999908 | -0.883 | -0.282 | -0.031 |
| 1.394999999999908 | -0.876 | -0.279 | -0.03 |
| 1.399999999999908 | -0.869 | -0.276 | -0.03 |
| 1.404999999999908 | -0.862 | -0.273 | -0.029 |
| 1.409999999999908 | -0.855 | -0.27 | -0.029 |
| 1.414999999999907 | -0.848 | -0.267 | -0.028 |
| 1.419999999999907 | -0.841 | -0.264 | -0.027 |
| 1.424999999999907 | -0.834 | -0.261 | -0.027 |
| 1.429999999999907 | -0.827 | -0.258 | -0.026 |
| 1.434999999999907 | -0.82 | -0.255 | -0.026 |
| 1.439999999999907 | -0.814 | -0.252 | -0.025 |
| 1.444999999999907 | -0.807 | -0.249 | -0.025 |
| 1.449999999999907 | -0.801 | -0.246 | -0.024 |
| 1.454999999999907 | -0.794 | -0.244 | -0.024 |
| 1.459999999999906 | -0.788 | -0.241 | -0.023 |
| 1.464999999999906 | -0.782 | -0.238 | -0.023 |
| 1.469999999999906 | -0.775 | -0.236 | -0.022 |
| 1.474999999999906 | -0.769 | -0.233 | -0.022 |
| 1.479999999999906 | -0.763 | -0.231 | -0.022 |
| 1.484999999999906 | -0.757 | -0.228 | -0.021 |
| 1.489999999999906 | -0.751 | -0.225 | -0.021 |
| 1.494999999999906 | -0.745 | -0.223 | -0.02 |
| 1.499999999999906 | -0.739 | -0.221 | -0.02 |
| 1.504999999999906 | -0.734 | -0.218 | -0.02 |
| 1.509999999999905 | -0.728 | -0.216 | -0.019 |
| 1.514999999999905 | -0.722 | -0.213 | -0.019 |
| 1.519999999999905 | -0.717 | -0.211 | -0.018 |
| 1.524999999999905 | -0.711 | -0.209 | -0.018 |
| 1.529999999999905 | -0.706 | -0.206 | -0.018 |
| 1.534999999999905 | -0.7 | -0.204 | -0.017 |
| 1.539999999999905 | -0.695 | -0.202 | -0.017 |
| 1.544999999999905 | -0.689 | -0.2 | -0.017 |
| 1.549999999999905 | -0.684 | -0.198 | -0.016 |
| 1.554999999999904 | -0.679 | -0.195 | -0.016 |
| 1.559999999999904 | -0.674 | -0.193 | -0.016 |
| 1.564999999999904 | -0.669 | -0.191 | -0.015 |
| 1.569999999999904 | -0.663 | -0.189 | -0.015 |
| 1.574999999999904 | -0.658 | -0.187 | -0.015 |
| 1.579999999999904 | -0.653 | -0.185 | -0.014 |
| 1.584999999999904 | -0.648 | -0.183 | -0.014 |
| 1.589999999999904 | -0.644 | -0.181 | -0.014 |
| 1.594999999999904 | -0.639 | -0.179 | -0.014 |
| 1.599999999999903 | -0.634 | -0.177 | -0.013 |
| 1.604999999999903 | -0.629 | -0.175 | -0.013 |
| 1.609999999999903 | -0.624 | -0.173 | -0.013 |
| 1.614999999999903 | -0.62 | -0.172 | -0.013 |
| 1.619999999999903 | -0.615 | -0.17 | -0.012 |
| 1.624999999999903 | -0.611 | -0.168 | -0.012 |
| 1.629999999999903 | -0.606 | -0.166 | -0.012 |
| 1.634999999999903 | -0.602 | -0.164 | -0.012 |
| 1.639999999999903 | -0.597 | -0.163 | -0.011 |
| 1.644999999999902 | -0.593 | -0.161 | -0.011 |
| 1.649999999999902 | -0.588 | -0.159 | -0.011 |
| 1.654999999999902 | -0.584 | -0.157 | -0.011 |
| 1.659999999999902 | -0.58 | -0.156 | -0.01 |
| 1.664999999999902 | -0.576 | -0.154 | -0.01 |
| 1.669999999999902 | -0.571 | -0.152 | -0.01 |
| 1.674999999999902 | -0.567 | -0.151 | -0.01 |
| 1.679999999999902 | -0.563 | -0.149 | -0.01 |
| 1.684999999999902 | -0.559 | -0.148 | -0.009 |
| 1.689999999999901 | -0.555 | -0.146 | -0.009 |
| 1.694999999999901 | -0.551 | -0.144 | -0.009 |
| 1.699999999999901 | -0.547 | -0.143 | -0.009 |
| 1.704999999999901 | -0.543 | -0.141 | -0.009 |
| 1.709999999999901 | -0.539 | -0.14 | -0.009 |
| 1.714999999999901 | -0.535 | -0.138 | -0.008 |
| 1.719999999999901 | -0.531 | -0.137 | -0.008 |
| 1.724999999999901 | -0.528 | -0.135 | -0.008 |
| 1.729999999999901 | -0.524 | -0.134 | -0.008 |
| 1.734999999999901 | -0.52 | -0.133 | -0.008 |
| 1.7399999999999 | -0.516 | -0.131 | -0.008 |
| 1.7449999999999 | -0.513 | -0.13 | -0.007 |
| 1.7499999999999 | -0.509 | -0.128 | -0.007 |
| 1.7549999999999 | -0.506 | -0.127 | -0.007 |
| 1.7599999999999 | -0.502 | -0.126 | -0.007 |
| 1.7649999999999 | -0.498 | -0.124 | -0.007 |
| 1.7699999999999 | -0.495 | -0.123 | -0.007 |
| 1.7749999999999 | -0.491 | -0.122 | -0.007 |
| 1.7799999999999 | -0.488 | -0.121 | -0.006 |
| 1.784999999999899 | -0.485 | -0.119 | -0.006 |
| 1.789999999999899 | -0.481 | -0.118 | -0.006 |
| 1.794999999999899 | -0.478 | -0.117 | -0.006 |
| 1.799999999999899 | -0.475 | -0.116 | -0.006 |
| 1.804999999999899 | -0.471 | -0.114 | -0.006 |
| 1.809999999999899 | -0.468 | -0.113 | -0.006 |
| 1.814999999999899 | -0.465 | -0.112 | -0.006 |
| 1.819999999999899 | -0.461 | -0.111 | -0.006 |
| 1.824999999999899 | -0.458 | -0.11 | -0.005 |
| 1.829999999999899 | -0.455 | -0.108 | -0.005 |
| 1.834999999999898 | -0.452 | -0.107 | -0.005 |
| 1.839999999999898 | -0.449 | -0.106 | -0.005 |
| 1.844999999999898 | -0.446 | -0.105 | -0.005 |
| 1.849999999999898 | -0.443 | -0.104 | -0.005 |
| 1.854999999999898 | -0.44 | -0.103 | -0.005 |
| 1.859999999999898 | -0.437 | -0.102 | -0.005 |
| 1.864999999999898 | -0.434 | -0.101 | -0.005 |
| 1.869999999999898 | -0.431 | -0.1 | -0.005 |
| 1.874999999999898 | -0.428 | -0.099 | -0.004 |
| 1.879999999999897 | -0.425 | -0.098 | -0.004 |
| 1.884999999999897 | -0.422 | -0.097 | -0.004 |
| 1.889999999999897 | -0.419 | -0.096 | -0.004 |
| 1.894999999999897 | -0.416 | -0.095 | -0.004 |
| 1.899999999999897 | -0.414 | -0.094 | -0.004 |
| 1.904999999999897 | -0.411 | -0.093 | -0.004 |
| 1.909999999999897 | -0.408 | -0.092 | -0.004 |
| 1.914999999999897 | -0.405 | -0.091 | -0.004 |
| 1.919999999999897 | -0.403 | -0.09 | -0.004 |
| 1.924999999999897 | -0.4 | -0.089 | -0.004 |
| 1.929999999999896 | -0.397 | -0.088 | -0.004 |
| 1.934999999999896 | -0.395 | -0.087 | -0.003 |
| 1.939999999999896 | -0.392 | -0.086 | -0.003 |
| 1.944999999999896 | -0.389 | -0.085 | -0.003 |
| 1.949999999999896 | -0.387 | -0.084 | -0.003 |
| 1.954999999999896 | -0.384 | -0.083 | -0.003 |
| 1.959999999999896 | -0.382 | -0.083 | -0.003 |
| 1.964999999999896 | -0.379 | -0.082 | -0.003 |
| 1.969999999999896 | -0.377 | -0.081 | -0.003 |
| 1.974999999999895 | -0.374 | -0.08 | -0.003 |
| 1.979999999999895 | -0.372 | -0.079 | -0.003 |
| 1.984999999999895 | -0.369 | -0.078 | -0.003 |
| 1.989999999999895 | -0.367 | -0.078 | -0.003 |
| 1.994999999999895 | -0.364 | -0.077 | -0.003 |
| 1.999999999999895 | -0.362 | -0.076 | -0.003 |
| 2.004999999999895 | -0.36 | -0.075 | -0.003 |
| 2.009999999999895 | -0.357 | -0.074 | -0.003 |
| 2.014999999999895 | -0.355 | -0.074 | -0.003 |
| 2.019999999999895 | -0.353 | -0.073 | -0.002 |
| 2.024999999999895 | -0.35 | -0.072 | -0.002 |
| 2.029999999999895 | -0.348 | -0.071 | -0.002 |
| 2.034999999999894 | -0.346 | -0.071 | -0.002 |
| 2.039999999999894 | -0.344 | -0.07 | -0.002 |
| 2.044999999999894 | -0.341 | -0.069 | -0.002 |
| 2.049999999999894 | -0.339 | -0.069 | -0.002 |
| 2.054999999999894 | -0.337 | -0.068 | -0.002 |
| 2.059999999999894 | -0.335 | -0.067 | -0.002 |
| 2.064999999999894 | -0.333 | -0.066 | -0.002 |
| 2.069999999999894 | -0.331 | -0.066 | -0.002 |
| 2.074999999999894 | -0.328 | -0.065 | -0.002 |
| 2.079999999999893 | -0.326 | -0.064 | -0.002 |
| 2.084999999999893 | -0.324 | -0.064 | -0.002 |
| 2.089999999999893 | -0.322 | -0.063 | -0.002 |
| 2.094999999999893 | -0.32 | -0.062 | -0.002 |
| 2.099999999999893 | -0.318 | -0.062 | -0.002 |
| 2.104999999999893 | -0.316 | -0.061 | -0.002 |
| 2.109999999999893 | -0.314 | -0.061 | -0.002 |
| 2.114999999999893 | -0.312 | -0.06 | -0.002 |
| 2.119999999999893 | -0.31 | -0.059 | -0.002 |
| 2.124999999999893 | -0.308 | -0.059 | -0.002 |
| 2.129999999999892 | -0.306 | -0.058 | -0.002 |
| 2.134999999999892 | -0.304 | -0.058 | -0.002 |
| 2.139999999999892 | -0.302 | -0.057 | -0.002 |
| 2.144999999999892 | -0.3 | -0.056 | -0.002 |
| 2.149999999999892 | -0.298 | -0.056 | -0.001 |
| 2.154999999999892 | -0.297 | -0.055 | -0.001 |
| 2.159999999999892 | -0.295 | -0.055 | -0.001 |
| 2.164999999999892 | -0.293 | -0.054 | -0.001 |
| 2.169999999999892 | -0.291 | -0.054 | -0.001 |
| 2.174999999999891 | -0.289 | -0.053 | -0.001 |
| 2.179999999999891 | -0.287 | -0.052 | -0.001 |
| 2.184999999999891 | -0.286 | -0.052 | -0.001 |
| 2.189999999999891 | -0.284 | -0.051 | -0.001 |
| 2.194999999999891 | -0.282 | -0.051 | -0.001 |
| 2.199999999999891 | -0.28 | -0.05 | -0.001 |
| 2.204999999999891 | -0.279 | -0.05 | -0.001 |
| 2.209999999999891 | -0.277 | -0.049 | -0.001 |
| 2.214999999999891 | -0.275 | -0.049 | -0.001 |
| 2.21999999999989 | -0.273 | -0.048 | -0.001 |
| 2.22499999999989 | -0.272 | -0.048 | -0.001 |
| 2.22999999999989 | -0.27 | -0.047 | -0.001 |
| 2.23499999999989 | -0.268 | -0.047 | -0.001 |
| 2.23999999999989 | -0.267 | -0.046 | -0.001 |
| 2.24499999999989 | -0.265 | -0.046 | -0.001 |
| 2.24999999999989 | -0.263 | -0.045 | -0.001 |
| 2.25499999999989 | -0.262 | -0.045 | -0.001 |
| 2.25999999999989 | -0.26 | -0.045 | -0.001 |
| 2.26499999999989 | -0.259 | -0.044 | -0.001 |
| 2.269999999999889 | -0.257 | -0.044 | -0.001 |
| 2.274999999999889 | -0.255 | -0.043 | -0.001 |
| 2.279999999999889 | -0.254 | -0.043 | -0.001 |
| 2.284999999999889 | -0.252 | -0.042 | -0.001 |
| 2.289999999999889 | -0.251 | -0.042 | -0.001 |
| 2.294999999999889 | -0.249 | -0.041 | -0.001 |
| 2.299999999999889 | -0.248 | -0.041 | -0.001 |
| 2.304999999999889 | -0.246 | -0.041 | -0.001 |
| 2.309999999999889 | -0.245 | -0.04 | -0.001 |
| 2.314999999999888 | -0.243 | -0.04 | -0.001 |
| 2.319999999999888 | -0.242 | -0.039 | -0.001 |
| 2.324999999999888 | -0.24 | -0.039 | -0.001 |
| 2.329999999999888 | -0.239 | -0.039 | -0.001 |
| 2.334999999999888 | -0.237 | -0.038 | -0.001 |
| 2.339999999999888 | -0.236 | -0.038 | -0.001 |
| 2.344999999999888 | -0.234 | -0.037 | -0.001 |
| 2.349999999999888 | -0.233 | -0.037 | -0.001 |
| 2.354999999999888 | -0.232 | -0.037 | -0.001 |
| 2.359999999999887 | -0.23 | -0.036 | -0.001 |
| 2.364999999999887 | -0.229 | -0.036 | -0.001 |
| 2.369999999999887 | -0.228 | -0.036 | -0.001 |
| 2.374999999999887 | -0.226 | -0.035 | -0.001 |
| 2.379999999999887 | -0.225 | -0.035 | -0.001 |
| 2.384999999999887 | -0.223 | -0.035 | -0.001 |
| 2.389999999999887 | -0.222 | -0.034 | -0.001 |
| 2.394999999999887 | -0.221 | -0.034 | -0.001 |
| 2.399999999999887 | -0.219 | -0.033 | -0.001 |
| 2.404999999999887 | -0.218 | -0.033 | -0.001 |
| 2.409999999999886 | -0.217 | -0.033 | -0.001 |
| 2.414999999999886 | -0.216 | -0.032 | -0.001 |
| 2.419999999999886 | -0.214 | -0.032 | -0.001 |
| 2.424999999999886 | -0.213 | -0.032 | 0 |
| 2.429999999999886 | -0.212 | -0.031 | 0 |
| 2.434999999999886 | -0.21 | -0.031 | 0 |
| 2.439999999999886 | -0.209 | -0.031 | 0 |
| 2.444999999999886 | -0.208 | -0.031 | 0 |
| 2.449999999999886 | -0.207 | -0.03 | 0 |
| 2.454999999999885 | -0.206 | -0.03 | 0 |
| 2.459999999999885 | -0.204 | -0.03 | 0 |
| 2.464999999999885 | -0.203 | -0.029 | 0 |
| 2.469999999999885 | -0.202 | -0.029 | 0 |
| 2.474999999999885 | -0.201 | -0.029 | 0 |
| 2.479999999999885 | -0.2 | -0.028 | 0 |
| 2.484999999999885 | -0.198 | -0.028 | 0 |
| 2.489999999999885 | -0.197 | -0.028 | 0 |
| 2.494999999999885 | -0.196 | -0.028 | 0 |
| 2.499999999999884 | -0.195 | -0.027 | 0 |
| 2.504999999999884 | -0.194 | -0.027 | 0 |
| 2.509999999999884 | -0.193 | -0.027 | 0 |
| 2.514999999999884 | -0.191 | -0.027 | 0 |
| 2.519999999999884 | -0.19 | -0.026 | 0 |
| 2.524999999999884 | -0.189 | -0.026 | 0 |
| 2.529999999999884 | -0.188 | -0.026 | 0 |
| 2.534999999999884 | -0.187 | -0.025 | 0 |
| 2.539999999999884 | -0.186 | -0.025 | 0 |
| 2.544999999999884 | -0.185 | -0.025 | 0 |
| 2.549999999999883 | -0.184 | -0.025 | 0 |
| 2.554999999999883 | -0.183 | -0.024 | 0 |
| 2.559999999999883 | -0.182 | -0.024 | 0 |
| 2.564999999999883 | -0.181 | -0.024 | 0 |
| 2.569999999999883 | -0.179 | -0.024 | 0 |
| 2.574999999999883 | -0.178 | -0.023 | 0 |
| 2.579999999999883 | -0.177 | -0.023 | 0 |
| 2.584999999999883 | -0.176 | -0.023 | 0 |
| 2.589999999999883 | -0.175 | -0.023 | 0 |
| 2.594999999999882 | -0.174 | -0.023 | 0 |
| 2.599999999999882 | -0.173 | -0.022 | 0 |
| 2.604999999999882 | -0.172 | -0.022 | 0 |
| 2.609999999999882 | -0.171 | -0.022 | 0 |
| 2.614999999999882 | -0.17 | -0.022 | 0 |
| 2.619999999999882 | -0.169 | -0.021 | 0 |
| 2.624999999999882 | -0.168 | -0.021 | 0 |
| 2.629999999999882 | -0.167 | -0.021 | 0 |
| 2.634999999999882 | -0.166 | -0.021 | 0 |
| 2.639999999999881 | -0.166 | -0.021 | 0 |
| 2.644999999999881 | -0.165 | -0.02 | 0 |
| 2.649999999999881 | -0.164 | -0.02 | 0 |
| 2.654999999999881 | -0.163 | -0.02 | 0 |
| 2.659999999999881 | -0.162 | -0.02 | 0 |
| 2.664999999999881 | -0.161 | -0.02 | 0 |
| 2.669999999999881 | -0.16 | -0.019 | 0 |
| 2.674999999999881 | -0.159 | -0.019 | 0 |
| 2.679999999999881 | -0.158 | -0.019 | 0 |
| 2.68499999999988 | -0.157 | -0.019 | 0 |
| 2.68999999999988 | -0.156 | -0.019 | 0 |
| 2.69499999999988 | -0.155 | -0.018 | 0 |
| 2.69999999999988 | -0.154 | -0.018 | 0 |
| 2.70499999999988 | -0.154 | -0.018 | 0 |
| 2.70999999999988 | -0.153 | -0.018 | 0 |
| 2.71499999999988 | -0.152 | -0.018 | 0 |
| 2.71999999999988 | -0.151 | -0.018 | 0 |
| 2.72499999999988 | -0.15 | -0.017 | 0 |
| 2.72999999999988 | -0.149 | -0.017 | 0 |
| 2.734999999999879 | -0.148 | -0.017 | 0 |
| 2.739999999999879 | -0.148 | -0.017 | 0 |
| 2.744999999999879 | -0.147 | -0.017 | 0 |
| 2.749999999999879 | -0.146 | -0.016 | 0 |
| 2.754999999999879 | -0.145 | -0.016 | 0 |
| 2.759999999999879 | -0.144 | -0.016 | 0 |
| 2.764999999999879 | -0.143 | -0.016 | 0 |
| 2.769999999999879 | -0.143 | -0.016 | 0 |
| 2.774999999999879 | -0.142 | -0.016 | 0 |
| 2.779999999999878 | -0.141 | -0.016 | 0 |
| 2.784999999999878 | -0.14 | -0.015 | 0 |
| 2.789999999999878 | -0.139 | -0.015 | 0 |
| 2.794999999999878 | -0.139 | -0.015 | 0 |
| 2.799999999999878 | -0.138 | -0.015 | 0 |
| 2.804999999999878 | -0.137 | -0.015 | 0 |
| 2.809999999999878 | -0.136 | -0.015 | 0 |
| 2.814999999999878 | -0.136 | -0.014 | 0 |
| 2.819999999999878 | -0.135 | -0.014 | 0 |
| 2.824999999999878 | -0.134 | -0.014 | 0 |
| 2.829999999999877 | -0.133 | -0.014 | 0 |
| 2.834999999999877 | -0.133 | -0.014 | 0 |
| 2.839999999999877 | -0.132 | -0.014 | 0 |
| 2.844999999999877 | -0.131 | -0.014 | 0 |
| 2.849999999999877 | -0.13 | -0.013 | 0 |
| 2.854999999999877 | -0.13 | -0.013 | 0 |
| 2.859999999999877 | -0.129 | -0.013 | 0 |
| 2.864999999999877 | -0.128 | -0.013 | 0 |
| 2.869999999999877 | -0.127 | -0.013 | 0 |
| 2.874999999999876 | -0.127 | -0.013 | 0 |
| 2.879999999999876 | -0.126 | -0.013 | 0 |
| 2.884999999999876 | -0.125 | -0.013 | 0 |
| 2.889999999999876 | -0.125 | -0.012 | 0 |
| 2.894999999999876 | -0.124 | -0.012 | 0 |
| 2.899999999999876 | -0.123 | -0.012 | 0 |
| 2.904999999999876 | -0.123 | -0.012 | 0 |
| 2.909999999999876 | -0.122 | -0.012 | 0 |
| 2.914999999999876 | -0.121 | -0.012 | 0 |
| 2.919999999999876 | -0.121 | -0.012 | 0 |
| 2.924999999999875 | -0.12 | -0.012 | 0 |
| 2.929999999999875 | -0.119 | -0.011 | 0 |
| 2.934999999999875 | -0.119 | -0.011 | 0 |
| 2.939999999999875 | -0.118 | -0.011 | 0 |
| 2.944999999999875 | -0.117 | -0.011 | 0 |
| 2.949999999999875 | -0.117 | -0.011 | 0 |
| 2.954999999999875 | -0.116 | -0.011 | 0 |
| 2.959999999999875 | -0.115 | -0.011 | 0 |
| 2.964999999999875 | -0.115 | -0.011 | 0 |
| 2.969999999999874 | -0.114 | -0.011 | 0 |
| 2.974999999999874 | -0.113 | -0.01 | 0 |
| 2.979999999999874 | -0.113 | -0.01 | 0 |
| 2.984999999999874 | -0.112 | -0.01 | 0 |
| 2.989999999999874 | -0.112 | -0.01 | 0 |
| 2.994999999999874 | -0.111 | -0.01 | 0 |
| 2.999999999999874 | -0.11 | -0.01 | 0 |
| 3.004999999999874 | -0.11 | -0.01 | 0 |
| 3.009999999999874 | -0.109 | -0.01 | 0 |
| 3.014999999999874 | -0.108 | -0.01 | 0 |
| 3.019999999999873 | -0.108 | -0.01 | 0 |
| 3.024999999999873 | -0.107 | -0.009 | 0 |
| 3.029999999999873 | -0.107 | -0.009 | 0 |
| 3.034999999999873 | -0.106 | -0.009 | 0 |
| 3.039999999999873 | -0.106 | -0.009 | 0 |
| 3.044999999999873 | -0.105 | -0.009 | 0 |
| 3.049999999999873 | -0.104 | -0.009 | 0 |
| 3.054999999999873 | -0.104 | -0.009 | 0 |
| 3.059999999999873 | -0.103 | -0.009 | 0 |
| 3.064999999999872 | -0.103 | -0.009 | 0 |
| 3.069999999999872 | -0.102 | -0.009 | 0 |
| 3.074999999999872 | -0.102 | -0.009 | 0 |
| 3.079999999999872 | -0.101 | -0.008 | 0 |
| 3.084999999999872 | -0.1 | -0.008 | 0 |
| 3.089999999999872 | -0.1 | -0.008 | 0 |
| 3.094999999999872 | -0.099 | -0.008 | 0 |
| 3.099999999999872 | -0.099 | -0.008 | 0 |
| 3.104999999999872 | -0.098 | -0.008 | 0 |
| 3.109999999999872 | -0.098 | -0.008 | 0 |
| 3.114999999999871 | -0.097 | -0.008 | 0 |
| 3.119999999999871 | -0.097 | -0.008 | 0 |
| 3.124999999999871 | -0.096 | -0.008 | 0 |
| 3.129999999999871 | -0.096 | -0.008 | 0 |
| 3.134999999999871 | -0.095 | -0.008 | 0 |
| 3.139999999999871 | -0.095 | -0.008 | 0 |
| 3.144999999999871 | -0.094 | -0.007 | 0 |
| 3.149999999999871 | -0.094 | -0.007 | 0 |
| 3.154999999999871 | -0.093 | -0.007 | 0 |
| 3.15999999999987 | -0.093 | -0.007 | 0 |
| 3.16499999999987 | -0.092 | -0.007 | 0 |
| 3.16999999999987 | -0.092 | -0.007 | 0 |
| 3.17499999999987 | -0.091 | -0.007 | 0 |
| 3.17999999999987 | -0.091 | -0.007 | 0 |
| 3.18499999999987 | -0.09 | -0.007 | 0 |
| 3.18999999999987 | -0.09 | -0.007 | 0 |
| 3.19499999999987 | -0.089 | -0.007 | 0 |
| 3.19999999999987 | -0.089 | -0.007 | 0 |
| 3.204999999999869 | -0.088 | -0.007 | 0 |
| 3.209999999999869 | -0.088 | -0.007 | 0 |
| 3.214999999999869 | -0.087 | -0.006 | 0 |
| 3.219999999999869 | -0.087 | -0.006 | 0 |
| 3.224999999999869 | -0.086 | -0.006 | 0 |
| 3.229999999999869 | -0.086 | -0.006 | 0 |
| 3.234999999999869 | -0.085 | -0.006 | 0 |
| 3.239999999999869 | -0.085 | -0.006 | 0 |
| 3.244999999999869 | -0.084 | -0.006 | 0 |
| 3.249999999999869 | -0.084 | -0.006 | 0 |
| 3.254999999999868 | -0.083 | -0.006 | 0 |
| 3.259999999999868 | -0.083 | -0.006 | 0 |
| 3.264999999999868 | -0.083 | -0.006 | 0 |
| 3.269999999999868 | -0.082 | -0.006 | 0 |
| 3.274999999999868 | -0.082 | -0.006 | 0 |
| 3.279999999999868 | -0.081 | -0.006 | 0 |
| 3.284999999999868 | -0.081 | -0.006 | 0 |
| 3.289999999999868 | -0.08 | -0.006 | 0 |
| 3.294999999999868 | -0.08 | -0.006 | 0 |
| 3.299999999999867 | -0.08 | -0.005 | 0 |
| 3.304999999999867 | -0.079 | -0.005 | 0 |
| 3.309999999999867 | -0.079 | -0.005 | 0 |
| 3.314999999999867 | -0.078 | -0.005 | 0 |
| 3.319999999999867 | -0.078 | -0.005 | 0 |
| 3.324999999999867 | -0.077 | -0.005 | 0 |
| 3.329999999999867 | -0.077 | -0.005 | 0 |
| 3.334999999999867 | -0.077 | -0.005 | 0 |
| 3.339999999999867 | -0.076 | -0.005 | 0 |
| 3.344999999999866 | -0.076 | -0.005 | 0 |
| 3.349999999999866 | -0.075 | -0.005 | 0 |
| 3.354999999999866 | -0.075 | -0.005 | 0 |
| 3.359999999999866 | -0.075 | -0.005 | 0 |
| 3.364999999999866 | -0.074 | -0.005 | 0 |
| 3.369999999999866 | -0.074 | -0.005 | 0 |
| 3.374999999999866 | -0.073 | -0.005 | 0 |
| 3.379999999999866 | -0.073 | -0.005 | 0 |
| 3.384999999999866 | -0.073 | -0.005 | 0 |
| 3.389999999999866 | -0.072 | -0.005 | 0 |
| 3.394999999999865 | -0.072 | -0.005 | 0 |
| 3.399999999999865 | -0.071 | -0.004 | 0 |
| 3.404999999999865 | -0.071 | -0.004 | 0 |
| 3.409999999999865 | -0.071 | -0.004 | 0 |
| 3.414999999999865 | -0.07 | -0.004 | 0 |
| 3.419999999999865 | -0.07 | -0.004 | 0 |
| 3.424999999999865 | -0.07 | -0.004 | 0 |
| 3.429999999999865 | -0.069 | -0.004 | 0 |
| 3.434999999999865 | -0.069 | -0.004 | 0 |
| 3.439999999999864 | -0.068 | -0.004 | 0 |
| 3.444999999999864 | -0.068 | -0.004 | 0 |
| 3.449999999999864 | -0.068 | -0.004 | 0 |
| 3.454999999999864 | -0.067 | -0.004 | 0 |
| 3.459999999999864 | -0.067 | -0.004 | 0 |
| 3.464999999999864 | -0.067 | -0.004 | 0 |
| 3.469999999999864 | -0.066 | -0.004 | 0 |
| 3.474999999999864 | -0.066 | -0.004 | 0 |
| 3.479999999999864 | -0.066 | -0.004 | 0 |
| 3.484999999999864 | -0.065 | -0.004 | 0 |
| 3.489999999999863 | -0.065 | -0.004 | 0 |
| 3.494999999999863 | -0.065 | -0.004 | 0 |
| 3.499999999999863 | -0.064 | -0.004 | 0 |
| 3.504999999999863 | -0.064 | -0.004 | 0 |
| 3.509999999999863 | -0.064 | -0.004 | 0 |
| 3.514999999999863 | -0.063 | -0.004 | 0 |
| 3.519999999999863 | -0.063 | -0.004 | 0 |
| 3.524999999999863 | -0.063 | -0.003 | 0 |
| 3.529999999999863 | -0.062 | -0.003 | 0 |
| 3.534999999999862 | -0.062 | -0.003 | 0 |
| 3.539999999999862 | -0.062 | -0.003 | 0 |
| 3.544999999999862 | -0.061 | -0.003 | 0 |
| 3.549999999999862 | -0.061 | -0.003 | 0 |
| 3.554999999999862 | -0.061 | -0.003 | 0 |
| 3.559999999999862 | -0.06 | -0.003 | 0 |
| 3.564999999999862 | -0.06 | -0.003 | 0 |
| 3.569999999999862 | -0.06 | -0.003 | 0 |
| 3.574999999999862 | -0.059 | -0.003 | 0 |
| 3.579999999999862 | -0.059 | -0.003 | 0 |
| 3.584999999999861 | -0.059 | -0.003 | 0 |
| 3.589999999999861 | -0.058 | -0.003 | 0 |
| 3.594999999999861 | -0.058 | -0.003 | 0 |
| 3.599999999999861 | -0.058 | -0.003 | 0 |
| 3.604999999999861 | -0.057 | -0.003 | 0 |
| 3.609999999999861 | -0.057 | -0.003 | 0 |
| 3.614999999999861 | -0.057 | -0.003 | 0 |
| 3.619999999999861 | -0.057 | -0.003 | 0 |
| 3.62499999999986 | -0.056 | -0.003 | 0 |
| 3.62999999999986 | -0.056 | -0.003 | 0 |
| 3.63499999999986 | -0.056 | -0.003 | 0 |
| 3.63999999999986 | -0.055 | -0.003 | 0 |
| 3.64499999999986 | -0.055 | -0.003 | 0 |
| 3.64999999999986 | -0.055 | -0.003 | 0 |
| 3.65499999999986 | -0.055 | -0.003 | 0 |
| 3.65999999999986 | -0.054 | -0.003 | 0 |
| 3.66499999999986 | -0.054 | -0.003 | 0 |
| 3.669999999999859 | -0.054 | -0.003 | 0 |
| 3.674999999999859 | -0.053 | -0.003 | 0 |
| 3.679999999999859 | -0.053 | -0.003 | 0 |
| 3.684999999999859 | -0.053 | -0.003 | 0 |
| 3.689999999999859 | -0.053 | -0.002 | 0 |
| 3.694999999999859 | -0.052 | -0.002 | 0 |
| 3.699999999999859 | -0.052 | -0.002 | 0 |
| 3.704999999999859 | -0.052 | -0.002 | 0 |
| 3.709999999999859 | -0.051 | -0.002 | 0 |
| 3.714999999999859 | -0.051 | -0.002 | 0 |
| 3.719999999999858 | -0.051 | -0.002 | 0 |
| 3.724999999999858 | -0.051 | -0.002 | 0 |
| 3.729999999999858 | -0.05 | -0.002 | 0 |
| 3.734999999999858 | -0.05 | -0.002 | 0 |
| 3.739999999999858 | -0.05 | -0.002 | 0 |
| 3.744999999999858 | -0.05 | -0.002 | 0 |
| 3.749999999999858 | -0.049 | -0.002 | 0 |
| 3.754999999999858 | -0.049 | -0.002 | 0 |
| 3.759999999999858 | -0.049 | -0.002 | 0 |
| 3.764999999999857 | -0.049 | -0.002 | 0 |
| 3.769999999999857 | -0.048 | -0.002 | 0 |
| 3.774999999999857 | -0.048 | -0.002 | 0 |
| 3.779999999999857 | -0.048 | -0.002 | 0 |
| 3.784999999999857 | -0.048 | -0.002 | 0 |
| 3.789999999999857 | -0.047 | -0.002 | 0 |
| 3.794999999999857 | -0.047 | -0.002 | 0 |
| 3.799999999999857 | -0.047 | -0.002 | 0 |
| 3.804999999999857 | -0.047 | -0.002 | 0 |
| 3.809999999999857 | -0.046 | -0.002 | 0 |
| 3.814999999999856 | -0.046 | -0.002 | 0 |
| 3.819999999999856 | -0.046 | -0.002 | 0 |
| 3.824999999999856 | -0.046 | -0.002 | 0 |
| 3.829999999999856 | -0.045 | -0.002 | 0 |
| 3.834999999999856 | -0.045 | -0.002 | 0 |
| 3.839999999999856 | -0.045 | -0.002 | 0 |
| 3.844999999999856 | -0.045 | -0.002 | 0 |
| 3.849999999999856 | -0.044 | -0.002 | 0 |
| 3.854999999999856 | -0.044 | -0.002 | 0 |
| 3.859999999999855 | -0.044 | -0.002 | 0 |
| 3.864999999999855 | -0.044 | -0.002 | 0 |
| 3.869999999999855 | -0.044 | -0.002 | 0 |
| 3.874999999999855 | -0.043 | -0.002 | 0 |
| 3.879999999999855 | -0.043 | -0.002 | 0 |
| 3.884999999999855 | -0.043 | -0.002 | 0 |
| 3.889999999999855 | -0.043 | -0.002 | 0 |
| 3.894999999999855 | -0.042 | -0.002 | 0 |
| 3.899999999999855 | -0.042 | -0.002 | 0 |
| 3.904999999999855 | -0.042 | -0.002 | 0 |
| 3.909999999999854 | -0.042 | -0.002 | 0 |
| 3.914999999999854 | -0.042 | -0.002 | 0 |
| 3.919999999999854 | -0.041 | -0.002 | 0 |
| 3.924999999999854 | -0.041 | -0.002 | 0 |
| 3.929999999999854 | -0.041 | -0.002 | 0 |
| 3.934999999999854 | -0.041 | -0.002 | 0 |
| 3.939999999999854 | -0.04 | -0.002 | 0 |
| 3.944999999999854 | -0.04 | -0.001 | 0 |
| 3.949999999999854 | -0.04 | -0.001 | 0 |
| 3.954999999999853 | -0.04 | -0.001 | 0 |
| 3.959999999999853 | -0.04 | -0.001 | 0 |
| 3.964999999999853 | -0.039 | -0.001 | 0 |
| 3.969999999999853 | -0.039 | -0.001 | 0 |
| 3.974999999999853 | -0.039 | -0.001 | 0 |
| 3.979999999999853 | -0.039 | -0.001 | 0 |
| 3.984999999999853 | -0.039 | -0.001 | 0 |
| 3.989999999999853 | -0.038 | -0.001 | 0 |
| 3.994999999999853 | -0.038 | -0.001 | 0 |
| 3.999999999999853 | -0.038 | -0.001 | 0 |
| 4.004999999999852 | -0.038 | -0.001 | 0 |
| 4.009999999999852 | -0.038 | -0.001 | 0 |
| 4.014999999999852 | -0.037 | -0.001 | 0 |
| 4.019999999999852 | -0.037 | -0.001 | 0 |
| 4.024999999999852 | -0.037 | -0.001 | 0 |
| 4.029999999999852 | -0.037 | -0.001 | 0 |
| 4.034999999999852 | -0.037 | -0.001 | 0 |
| 4.039999999999851 | -0.036 | -0.001 | 0 |
| 4.044999999999852 | -0.036 | -0.001 | 0 |
| 4.049999999999851 | -0.036 | -0.001 | 0 |
| 4.054999999999851 | -0.036 | -0.001 | 0 |
| 4.059999999999851 | -0.036 | -0.001 | 0 |
| 4.064999999999851 | -0.036 | -0.001 | 0 |
| 4.069999999999851 | -0.035 | -0.001 | 0 |
| 4.074999999999851 | -0.035 | -0.001 | 0 |
| 4.07999999999985 | -0.035 | -0.001 | 0 |
| 4.084999999999851 | -0.035 | -0.001 | 0 |
| 4.08999999999985 | -0.035 | -0.001 | 0 |
| 4.094999999999851 | -0.034 | -0.001 | 0 |
| 4.09999999999985 | -0.034 | -0.001 | 0 |
| 4.10499999999985 | -0.034 | -0.001 | 0 |
| 4.10999999999985 | -0.034 | -0.001 | 0 |
| 4.11499999999985 | -0.034 | -0.001 | 0 |
| 4.11999999999985 | -0.034 | -0.001 | 0 |
| 4.12499999999985 | -0.033 | -0.001 | 0 |
| 4.12999999999985 | -0.033 | -0.001 | 0 |
| 4.13499999999985 | -0.033 | -0.001 | 0 |
| 4.13999999999985 | -0.033 | -0.001 | 0 |
| 4.144999999999849 | -0.033 | -0.001 | 0 |
| 4.14999999999985 | -0.033 | -0.001 | 0 |
| 4.154999999999849 | -0.032 | -0.001 | 0 |
| 4.15999999999985 | -0.032 | -0.001 | 0 |
| 4.164999999999849 | -0.032 | -0.001 | 0 |
| 4.169999999999849 | -0.032 | -0.001 | 0 |
| 4.174999999999849 | -0.032 | -0.001 | 0 |
| 4.179999999999848 | -0.032 | -0.001 | 0 |
| 4.184999999999849 | -0.031 | -0.001 | 0 |
| 4.189999999999848 | -0.031 | -0.001 | 0 |
| 4.194999999999848 | -0.031 | -0.001 | 0 |
| 4.199999999999848 | -0.031 | -0.001 | 0 |
| 4.204999999999848 | -0.031 | -0.001 | 0 |
| 4.209999999999848 | -0.031 | -0.001 | 0 |
| 4.214999999999848 | -0.03 | -0.001 | 0 |
| 4.219999999999847 | -0.03 | -0.001 | 0 |
| 4.224999999999848 | -0.03 | -0.001 | 0 |
| 4.229999999999847 | -0.03 | -0.001 | 0 |
| 4.234999999999847 | -0.03 | -0.001 | 0 |
| 4.239999999999847 | -0.03 | -0.001 | 0 |
| 4.244999999999847 | -0.03 | -0.001 | 0 |
| 4.249999999999847 | -0.029 | -0.001 | 0 |
| 4.254999999999847 | -0.029 | -0.001 | 0 |
| 4.259999999999846 | -0.029 | -0.001 | 0 |
| 4.264999999999847 | -0.029 | -0.001 | 0 |
| 4.269999999999846 | -0.029 | -0.001 | 0 |
| 4.274999999999846 | -0.029 | -0.001 | 0 |
| 4.279999999999846 | -0.028 | -0.001 | 0 |
| 4.284999999999846 | -0.028 | -0.001 | 0 |
| 4.289999999999846 | -0.028 | -0.001 | 0 |
| 4.294999999999846 | -0.028 | -0.001 | 0 |
| 4.299999999999846 | -0.028 | -0.001 | 0 |
| 4.304999999999846 | -0.028 | -0.001 | 0 |
| 4.309999999999845 | -0.028 | -0.001 | 0 |
| 4.314999999999846 | -0.027 | -0.001 | 0 |
| 4.319999999999845 | -0.027 | -0.001 | 0 |
| 4.324999999999846 | -0.027 | -0.001 | 0 |
| 4.329999999999845 | -0.027 | -0.001 | 0 |
| 4.334999999999845 | -0.027 | -0.001 | 0 |
| 4.339999999999845 | -0.027 | -0.001 | 0 |
| 4.344999999999845 | -0.027 | -0.001 | 0 |
| 4.349999999999845 | -0.026 | -0.001 | 0 |
| 4.354999999999845 | -0.026 | -0.001 | 0 |
| 4.359999999999844 | -0.026 | -0.001 | 0 |
| 4.364999999999845 | -0.026 | -0.001 | 0 |
| 4.369999999999844 | -0.026 | -0.001 | 0 |
| 4.374999999999844 | -0.026 | -0.001 | 0 |
| 4.379999999999844 | -0.026 | -0.001 | 0 |
| 4.384999999999844 | -0.026 | -0.001 | 0 |
| 4.389999999999844 | -0.025 | -0.001 | 0 |
| 4.394999999999844 | -0.025 | -0.001 | 0 |
| 4.399999999999844 | -0.025 | -0.001 | 0 |
| 4.404999999999844 | -0.025 | -0.001 | 0 |
| 4.409999999999843 | -0.025 | -0.001 | 0 |
| 4.414999999999844 | -0.025 | -0.001 | 0 |
| 4.419999999999843 | -0.025 | -0.001 | 0 |
| 4.424999999999843 | -0.025 | -0.001 | 0 |
| 4.429999999999843 | -0.024 | -0.001 | 0 |
| 4.434999999999843 | -0.024 | -0.001 | 0 |
| 4.439999999999843 | -0.024 | -0.001 | 0 |
| 4.444999999999843 | -0.024 | -0.001 | 0 |
| 4.449999999999842 | -0.024 | -0.001 | 0 |
| 4.454999999999843 | -0.024 | -0.001 | 0 |
| 4.459999999999842 | -0.024 | -0.001 | 0 |
| 4.464999999999843 | -0.024 | -0.001 | 0 |
| 4.469999999999842 | -0.023 | -0.001 | 0 |
| 4.474999999999842 | -0.023 | -0.001 | 0 |
| 4.479999999999842 | -0.023 | -0.001 | 0 |
| 4.484999999999842 | -0.023 | -0.001 | 0 |
| 4.489999999999842 | -0.023 | -0.001 | 0 |
| 4.494999999999842 | -0.023 | 0 | 0 |
| 4.499999999999841 | -0.023 | 0 | 0 |
| 4.504999999999842 | -0.023 | 0 | 0 |
| 4.509999999999841 | -0.022 | 0 | 0 |
| 4.514999999999842 | -0.022 | 0 | 0 |
| 4.519999999999841 | -0.022 | 0 | 0 |
| 4.524999999999841 | -0.022 | 0 | 0 |
| 4.529999999999841 | -0.022 | 0 | 0 |
| 4.534999999999841 | -0.022 | 0 | 0 |
| 4.53999999999984 | -0.022 | 0 | 0 |
| 4.544999999999841 | -0.022 | 0 | 0 |
| 4.54999999999984 | -0.022 | 0 | 0 |
| 4.554999999999841 | -0.021 | 0 | 0 |
| 4.55999999999984 | -0.021 | 0 | 0 |
| 4.564999999999841 | -0.021 | 0 | 0 |
| 4.56999999999984 | -0.021 | 0 | 0 |
| 4.57499999999984 | -0.021 | 0 | 0 |
| 4.57999999999984 | -0.021 | 0 | 0 |
| 4.58499999999984 | -0.021 | 0 | 0 |
| 4.58999999999984 | -0.021 | 0 | 0 |
| 4.59499999999984 | -0.021 | 0 | 0 |
| 4.59999999999984 | -0.021 | 0 | 0 |
| 4.60499999999984 | -0.02 | 0 | 0 |
| 4.60999999999984 | -0.02 | 0 | 0 |
| 4.614999999999839 | -0.02 | 0 | 0 |
| 4.61999999999984 | -0.02 | 0 | 0 |
| 4.624999999999839 | -0.02 | 0 | 0 |
| 4.62999999999984 | -0.02 | 0 | 0 |
| 4.634999999999839 | -0.02 | 0 | 0 |
| 4.639999999999838 | -0.02 | 0 | 0 |
| 4.644999999999839 | -0.02 | 0 | 0 |
| 4.649999999999838 | -0.019 | 0 | 0 |
| 4.654999999999839 | -0.019 | 0 | 0 |
| 4.659999999999838 | -0.019 | 0 | 0 |
| 4.664999999999838 | -0.019 | 0 | 0 |
| 4.669999999999838 | -0.019 | 0 | 0 |
| 4.674999999999838 | -0.019 | 0 | 0 |
| 4.679999999999837 | -0.019 | 0 | 0 |
| 4.684999999999838 | -0.019 | 0 | 0 |
| 4.689999999999837 | -0.019 | 0 | 0 |
| 4.694999999999838 | -0.019 | 0 | 0 |
| 4.699999999999837 | -0.019 | 0 | 0 |
| 4.704999999999837 | -0.018 | 0 | 0 |
| 4.709999999999837 | -0.018 | 0 | 0 |
| 4.714999999999837 | -0.018 | 0 | 0 |
| 4.719999999999837 | -0.018 | 0 | 0 |
| 4.724999999999837 | -0.018 | 0 | 0 |
| 4.729999999999836 | -0.018 | 0 | 0 |
| 4.734999999999836 | -0.018 | 0 | 0 |
| 4.739999999999836 | -0.018 | 0 | 0 |
| 4.744999999999836 | -0.018 | 0 | 0 |
| 4.749999999999836 | -0.018 | 0 | 0 |
| 4.754999999999836 | -0.018 | 0 | 0 |
| 4.759999999999836 | -0.017 | 0 | 0 |
| 4.764999999999836 | -0.017 | 0 | 0 |
| 4.769999999999836 | -0.017 | 0 | 0 |
| 4.774999999999835 | -0.017 | 0 | 0 |
| 4.779999999999835 | -0.017 | 0 | 0 |
| 4.784999999999835 | -0.017 | 0 | 0 |
| 4.789999999999835 | -0.017 | 0 | 0 |
| 4.794999999999835 | -0.017 | 0 | 0 |
| 4.799999999999835 | -0.017 | 0 | 0 |
| 4.804999999999835 | -0.017 | 0 | 0 |
| 4.809999999999835 | -0.017 | 0 | 0 |
| 4.814999999999835 | -0.016 | 0 | 0 |
| 4.819999999999835 | -0.016 | 0 | 0 |
| 4.824999999999835 | -0.016 | 0 | 0 |
| 4.829999999999834 | -0.016 | 0 | 0 |
| 4.834999999999834 | -0.016 | 0 | 0 |
| 4.839999999999834 | -0.016 | 0 | 0 |
| 4.844999999999834 | -0.016 | 0 | 0 |
| 4.849999999999834 | -0.016 | 0 | 0 |
| 4.854999999999834 | -0.016 | 0 | 0 |
| 4.859999999999834 | -0.016 | 0 | 0 |
| 4.864999999999834 | -0.016 | 0 | 0 |
| 4.869999999999834 | -0.016 | 0 | 0 |
| 4.874999999999834 | -0.016 | 0 | 0 |
| 4.879999999999833 | -0.015 | 0 | 0 |
| 4.884999999999834 | -0.015 | 0 | 0 |
| 4.889999999999833 | -0.015 | 0 | 0 |
| 4.894999999999833 | -0.015 | 0 | 0 |
| 4.899999999999833 | -0.015 | 0 | 0 |
| 4.904999999999833 | -0.015 | 0 | 0 |
| 4.909999999999833 | -0.015 | 0 | 0 |
| 4.914999999999833 | -0.015 | 0 | 0 |
| 4.919999999999832 | -0.015 | 0 | 0 |
| 4.924999999999833 | -0.015 | 0 | 0 |
| 4.929999999999832 | -0.015 | 0 | 0 |
| 4.934999999999832 | -0.015 | 0 | 0 |
| 4.939999999999832 | -0.015 | 0 | 0 |
| 4.944999999999832 | -0.014 | 0 | 0 |
| 4.949999999999832 | -0.014 | 0 | 0 |
| 4.954999999999832 | -0.014 | 0 | 0 |
| 4.959999999999832 | -0.014 | 0 | 0 |
| 4.964999999999832 | -0.014 | 0 | 0 |
| 4.969999999999831 | -0.014 | 0 | 0 |
| 4.974999999999831 | -0.014 | 0 | 0 |
| 4.97999999999983 | -0.014 | 0 | 0 |
| 4.984999999999831 | -0.014 | 0 | 0 |
| 4.98999999999983 | -0.014 | 0 | 0 |
| 4.994999999999831 | -0.014 | 0 | 0 |
| 4.99999999999983 | -0.014 | 0 | 0 |